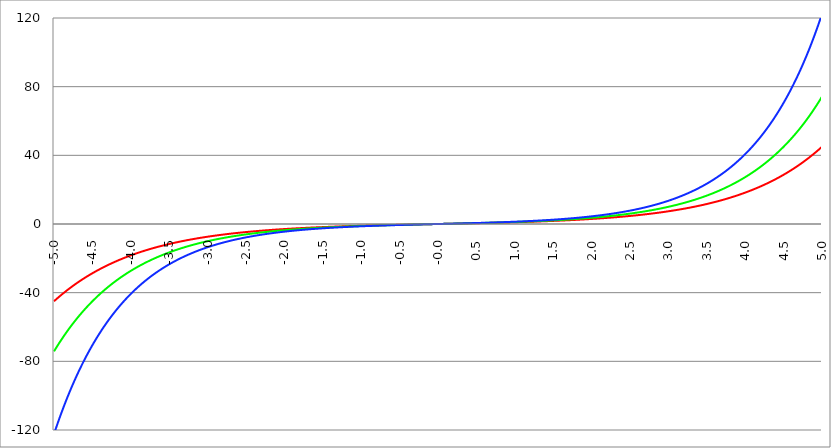
| Category | Series 1 | Series 0 | Series 2 |
|---|---|---|---|
| -5.0 | -45.003 | -74.203 | -122.344 |
| -4.995 | -44.801 | -73.833 | -121.673 |
| -4.99 | -44.6 | -73.465 | -121.005 |
| -4.985 | -44.399 | -73.098 | -120.342 |
| -4.98 | -44.2 | -72.734 | -119.682 |
| -4.975 | -44.001 | -72.371 | -119.025 |
| -4.97 | -43.804 | -72.01 | -118.372 |
| -4.965000000000001 | -43.607 | -71.651 | -117.723 |
| -4.960000000000001 | -43.411 | -71.293 | -117.077 |
| -4.955000000000001 | -43.216 | -70.938 | -116.435 |
| -4.950000000000001 | -43.022 | -70.584 | -115.796 |
| -4.945000000000001 | -42.829 | -70.232 | -115.161 |
| -4.940000000000001 | -42.637 | -69.882 | -114.53 |
| -4.935000000000001 | -42.445 | -69.533 | -113.901 |
| -4.930000000000001 | -42.255 | -69.186 | -113.277 |
| -4.925000000000002 | -42.065 | -68.841 | -112.655 |
| -4.920000000000002 | -41.876 | -68.498 | -112.037 |
| -4.915000000000002 | -41.688 | -68.156 | -111.423 |
| -4.910000000000002 | -41.501 | -67.816 | -110.812 |
| -4.905000000000002 | -41.314 | -67.478 | -110.204 |
| -4.900000000000002 | -41.129 | -67.141 | -109.599 |
| -4.895000000000002 | -40.944 | -66.806 | -108.998 |
| -4.890000000000002 | -40.76 | -66.473 | -108.4 |
| -4.885000000000002 | -40.577 | -66.141 | -107.806 |
| -4.880000000000002 | -40.395 | -65.812 | -107.214 |
| -4.875000000000003 | -40.213 | -65.483 | -106.626 |
| -4.870000000000003 | -40.033 | -65.157 | -106.042 |
| -4.865000000000003 | -39.853 | -64.832 | -105.46 |
| -4.860000000000003 | -39.674 | -64.508 | -104.881 |
| -4.855000000000003 | -39.496 | -64.186 | -104.306 |
| -4.850000000000003 | -39.318 | -63.866 | -103.734 |
| -4.845000000000003 | -39.142 | -63.548 | -103.165 |
| -4.840000000000003 | -38.966 | -63.231 | -102.599 |
| -4.835000000000003 | -38.791 | -62.915 | -102.036 |
| -4.830000000000004 | -38.617 | -62.601 | -101.477 |
| -4.825000000000004 | -38.443 | -62.289 | -100.92 |
| -4.820000000000004 | -38.271 | -61.979 | -100.366 |
| -4.815000000000004 | -38.099 | -61.669 | -99.816 |
| -4.810000000000004 | -37.928 | -61.362 | -99.268 |
| -4.805000000000004 | -37.757 | -61.056 | -98.724 |
| -4.800000000000004 | -37.588 | -60.751 | -98.182 |
| -4.795000000000004 | -37.419 | -60.448 | -97.644 |
| -4.790000000000004 | -37.251 | -60.147 | -97.108 |
| -4.785000000000004 | -37.083 | -59.847 | -96.576 |
| -4.780000000000004 | -36.917 | -59.548 | -96.046 |
| -4.775000000000004 | -36.751 | -59.251 | -95.519 |
| -4.770000000000004 | -36.586 | -58.955 | -94.995 |
| -4.765000000000005 | -36.422 | -58.661 | -94.474 |
| -4.760000000000005 | -36.258 | -58.369 | -93.956 |
| -4.755000000000005 | -36.095 | -58.078 | -93.44 |
| -4.750000000000005 | -35.933 | -57.788 | -92.928 |
| -4.745000000000005 | -35.772 | -57.5 | -92.418 |
| -4.740000000000005 | -35.611 | -57.213 | -91.911 |
| -4.735000000000005 | -35.451 | -56.927 | -91.407 |
| -4.730000000000005 | -35.292 | -56.643 | -90.906 |
| -4.725000000000006 | -35.133 | -56.361 | -90.407 |
| -4.720000000000006 | -34.976 | -56.08 | -89.911 |
| -4.715000000000006 | -34.818 | -55.8 | -89.418 |
| -4.710000000000006 | -34.662 | -55.522 | -88.927 |
| -4.705000000000006 | -34.506 | -55.245 | -88.44 |
| -4.700000000000006 | -34.351 | -54.969 | -87.955 |
| -4.695000000000006 | -34.197 | -54.695 | -87.472 |
| -4.690000000000006 | -34.043 | -54.422 | -86.992 |
| -4.685000000000007 | -33.891 | -54.151 | -86.515 |
| -4.680000000000007 | -33.738 | -53.88 | -86.041 |
| -4.675000000000007 | -33.587 | -53.612 | -85.569 |
| -4.670000000000007 | -33.436 | -53.344 | -85.099 |
| -4.665000000000007 | -33.286 | -53.078 | -84.632 |
| -4.660000000000007 | -33.136 | -52.813 | -84.168 |
| -4.655000000000007 | -32.987 | -52.55 | -83.707 |
| -4.650000000000007 | -32.839 | -52.288 | -83.247 |
| -4.645000000000007 | -32.692 | -52.027 | -82.791 |
| -4.640000000000008 | -32.545 | -51.767 | -82.337 |
| -4.635000000000008 | -32.399 | -51.509 | -81.885 |
| -4.630000000000008 | -32.253 | -51.252 | -81.436 |
| -4.625000000000008 | -32.108 | -50.996 | -80.989 |
| -4.620000000000008 | -31.964 | -50.742 | -80.545 |
| -4.615000000000008 | -31.82 | -50.489 | -80.103 |
| -4.610000000000008 | -31.677 | -50.237 | -79.664 |
| -4.605000000000008 | -31.535 | -49.986 | -79.227 |
| -4.600000000000008 | -31.393 | -49.737 | -78.792 |
| -4.595000000000009 | -31.252 | -49.489 | -78.36 |
| -4.590000000000009 | -31.112 | -49.242 | -77.93 |
| -4.585000000000009 | -30.972 | -48.996 | -77.503 |
| -4.580000000000009 | -30.833 | -48.752 | -77.077 |
| -4.57500000000001 | -30.695 | -48.509 | -76.655 |
| -4.57000000000001 | -30.557 | -48.267 | -76.234 |
| -4.565000000000009 | -30.419 | -48.026 | -75.816 |
| -4.560000000000009 | -30.283 | -47.787 | -75.4 |
| -4.555000000000009 | -30.147 | -47.548 | -74.987 |
| -4.55000000000001 | -30.011 | -47.311 | -74.575 |
| -4.54500000000001 | -29.877 | -47.075 | -74.166 |
| -4.54000000000001 | -29.742 | -46.84 | -73.759 |
| -4.53500000000001 | -29.609 | -46.606 | -73.355 |
| -4.53000000000001 | -29.476 | -46.374 | -72.952 |
| -4.52500000000001 | -29.343 | -46.143 | -72.552 |
| -4.52000000000001 | -29.211 | -45.912 | -72.154 |
| -4.51500000000001 | -29.08 | -45.683 | -71.758 |
| -4.51000000000001 | -28.95 | -45.455 | -71.365 |
| -4.505000000000011 | -28.819 | -45.229 | -70.973 |
| -4.500000000000011 | -28.69 | -45.003 | -70.584 |
| -4.495000000000011 | -28.561 | -44.779 | -70.197 |
| -4.490000000000011 | -28.433 | -44.555 | -69.812 |
| -4.485000000000011 | -28.305 | -44.333 | -69.429 |
| -4.480000000000011 | -28.178 | -44.112 | -69.048 |
| -4.475000000000011 | -28.051 | -43.892 | -68.669 |
| -4.470000000000011 | -27.925 | -43.673 | -68.292 |
| -4.465000000000011 | -27.8 | -43.455 | -67.918 |
| -4.460000000000011 | -27.675 | -43.238 | -67.545 |
| -4.455000000000012 | -27.551 | -43.022 | -67.175 |
| -4.450000000000012 | -27.427 | -42.808 | -66.806 |
| -4.445000000000012 | -27.304 | -42.594 | -66.44 |
| -4.440000000000012 | -27.181 | -42.382 | -66.075 |
| -4.435000000000012 | -27.059 | -42.17 | -65.713 |
| -4.430000000000012 | -26.937 | -41.96 | -65.352 |
| -4.425000000000012 | -26.816 | -41.75 | -64.994 |
| -4.420000000000012 | -26.696 | -41.542 | -64.637 |
| -4.415000000000012 | -26.576 | -41.335 | -64.283 |
| -4.410000000000013 | -26.456 | -41.129 | -63.93 |
| -4.405000000000013 | -26.337 | -40.923 | -63.579 |
| -4.400000000000013 | -26.219 | -40.719 | -63.231 |
| -4.395000000000013 | -26.101 | -40.516 | -62.884 |
| -4.390000000000013 | -25.984 | -40.314 | -62.539 |
| -4.385000000000013 | -25.867 | -40.113 | -62.196 |
| -4.380000000000013 | -25.751 | -39.913 | -61.855 |
| -4.375000000000013 | -25.635 | -39.714 | -61.515 |
| -4.370000000000013 | -25.52 | -39.515 | -61.178 |
| -4.365000000000013 | -25.406 | -39.318 | -60.842 |
| -4.360000000000014 | -25.291 | -39.122 | -60.509 |
| -4.355000000000014 | -25.178 | -38.927 | -60.177 |
| -4.350000000000014 | -25.065 | -38.733 | -59.847 |
| -4.345000000000014 | -24.952 | -38.54 | -59.518 |
| -4.340000000000014 | -24.84 | -38.347 | -59.192 |
| -4.335000000000014 | -24.728 | -38.156 | -58.867 |
| -4.330000000000014 | -24.617 | -37.966 | -58.544 |
| -4.325000000000014 | -24.506 | -37.776 | -58.223 |
| -4.320000000000014 | -24.396 | -37.588 | -57.904 |
| -4.315000000000015 | -24.287 | -37.4 | -57.586 |
| -4.310000000000015 | -24.178 | -37.214 | -57.27 |
| -4.305000000000015 | -24.069 | -37.028 | -56.956 |
| -4.300000000000015 | -23.961 | -36.843 | -56.643 |
| -4.295000000000015 | -23.853 | -36.659 | -56.333 |
| -4.290000000000015 | -23.746 | -36.476 | -56.024 |
| -4.285000000000015 | -23.639 | -36.294 | -55.716 |
| -4.280000000000015 | -23.533 | -36.113 | -55.411 |
| -4.275000000000015 | -23.427 | -35.933 | -55.107 |
| -4.270000000000015 | -23.322 | -35.754 | -54.804 |
| -4.265000000000016 | -23.217 | -35.575 | -54.504 |
| -4.260000000000016 | -23.113 | -35.398 | -54.205 |
| -4.255000000000016 | -23.009 | -35.221 | -53.907 |
| -4.250000000000016 | -22.905 | -35.046 | -53.612 |
| -4.245000000000016 | -22.803 | -34.871 | -53.318 |
| -4.240000000000016 | -22.7 | -34.697 | -53.025 |
| -4.235000000000016 | -22.598 | -34.524 | -52.734 |
| -4.230000000000016 | -22.496 | -34.351 | -52.445 |
| -4.225000000000017 | -22.395 | -34.18 | -52.157 |
| -4.220000000000017 | -22.295 | -34.009 | -51.871 |
| -4.215000000000017 | -22.195 | -33.84 | -51.586 |
| -4.210000000000017 | -22.095 | -33.671 | -51.303 |
| -4.205000000000017 | -21.995 | -33.503 | -51.022 |
| -4.200000000000017 | -21.897 | -33.336 | -50.742 |
| -4.195000000000017 | -21.798 | -33.169 | -50.464 |
| -4.190000000000017 | -21.7 | -33.004 | -50.187 |
| -4.185000000000017 | -21.603 | -32.839 | -49.912 |
| -4.180000000000017 | -21.506 | -32.675 | -49.638 |
| -4.175000000000018 | -21.409 | -32.512 | -49.365 |
| -4.170000000000018 | -21.313 | -32.35 | -49.095 |
| -4.165000000000018 | -21.217 | -32.189 | -48.825 |
| -4.160000000000018 | -21.122 | -32.028 | -48.557 |
| -4.155000000000018 | -21.027 | -31.868 | -48.291 |
| -4.150000000000018 | -20.932 | -31.709 | -48.026 |
| -4.145000000000018 | -20.838 | -31.551 | -47.763 |
| -4.140000000000018 | -20.744 | -31.393 | -47.501 |
| -4.135000000000018 | -20.651 | -31.237 | -47.24 |
| -4.130000000000019 | -20.558 | -31.081 | -46.981 |
| -4.125000000000019 | -20.466 | -30.926 | -46.723 |
| -4.120000000000019 | -20.374 | -30.771 | -46.467 |
| -4.115000000000019 | -20.282 | -30.618 | -46.212 |
| -4.110000000000019 | -20.191 | -30.465 | -45.958 |
| -4.105000000000019 | -20.1 | -30.313 | -45.706 |
| -4.100000000000019 | -20.01 | -30.162 | -45.455 |
| -4.095000000000019 | -19.92 | -30.011 | -45.206 |
| -4.090000000000019 | -19.83 | -29.862 | -44.958 |
| -4.085000000000019 | -19.741 | -29.713 | -44.711 |
| -4.08000000000002 | -19.653 | -29.564 | -44.466 |
| -4.07500000000002 | -19.564 | -29.417 | -44.222 |
| -4.07000000000002 | -19.476 | -29.27 | -43.979 |
| -4.06500000000002 | -19.389 | -29.124 | -43.738 |
| -4.06000000000002 | -19.301 | -28.979 | -43.498 |
| -4.05500000000002 | -19.215 | -28.834 | -43.26 |
| -4.05000000000002 | -19.128 | -28.69 | -43.022 |
| -4.04500000000002 | -19.042 | -28.547 | -42.786 |
| -4.04000000000002 | -18.957 | -28.404 | -42.551 |
| -4.03500000000002 | -18.871 | -28.263 | -42.318 |
| -4.03000000000002 | -18.787 | -28.122 | -42.086 |
| -4.025000000000021 | -18.702 | -27.981 | -41.855 |
| -4.020000000000021 | -18.618 | -27.842 | -41.625 |
| -4.015000000000021 | -18.534 | -27.703 | -41.397 |
| -4.010000000000021 | -18.451 | -27.564 | -41.17 |
| -4.005000000000021 | -18.368 | -27.427 | -40.944 |
| -4.000000000000021 | -18.285 | -27.29 | -40.719 |
| -3.995000000000021 | -18.203 | -27.154 | -40.496 |
| -3.990000000000021 | -18.121 | -27.018 | -40.274 |
| -3.985000000000022 | -18.04 | -26.883 | -40.053 |
| -3.980000000000022 | -17.959 | -26.749 | -39.833 |
| -3.975000000000022 | -17.878 | -26.616 | -39.614 |
| -3.970000000000022 | -17.798 | -26.483 | -39.397 |
| -3.965000000000022 | -17.718 | -26.351 | -39.181 |
| -3.960000000000022 | -17.638 | -26.219 | -38.966 |
| -3.955000000000022 | -17.559 | -26.088 | -38.752 |
| -3.950000000000022 | -17.48 | -25.958 | -38.54 |
| -3.945000000000022 | -17.401 | -25.828 | -38.328 |
| -3.940000000000023 | -17.323 | -25.7 | -38.118 |
| -3.935000000000023 | -17.245 | -25.571 | -37.909 |
| -3.930000000000023 | -17.167 | -25.444 | -37.701 |
| -3.925000000000023 | -17.09 | -25.317 | -37.494 |
| -3.920000000000023 | -17.013 | -25.19 | -37.288 |
| -3.915000000000023 | -16.937 | -25.065 | -37.083 |
| -3.910000000000023 | -16.861 | -24.939 | -36.88 |
| -3.905000000000023 | -16.785 | -24.815 | -36.678 |
| -3.900000000000023 | -16.709 | -24.691 | -36.476 |
| -3.895000000000023 | -16.634 | -24.568 | -36.276 |
| -3.890000000000024 | -16.559 | -24.445 | -36.077 |
| -3.885000000000024 | -16.485 | -24.323 | -35.879 |
| -3.880000000000024 | -16.411 | -24.202 | -35.682 |
| -3.875000000000024 | -16.337 | -24.081 | -35.487 |
| -3.870000000000024 | -16.263 | -23.961 | -35.292 |
| -3.865000000000024 | -16.19 | -23.841 | -35.098 |
| -3.860000000000024 | -16.117 | -23.722 | -34.906 |
| -3.855000000000024 | -16.045 | -23.604 | -34.714 |
| -3.850000000000024 | -15.973 | -23.486 | -34.524 |
| -3.845000000000025 | -15.901 | -23.369 | -34.334 |
| -3.840000000000025 | -15.829 | -23.252 | -34.146 |
| -3.835000000000025 | -15.758 | -23.136 | -33.958 |
| -3.830000000000025 | -15.687 | -23.02 | -33.772 |
| -3.825000000000025 | -15.617 | -22.905 | -33.587 |
| -3.820000000000025 | -15.546 | -22.791 | -33.402 |
| -3.815000000000025 | -15.476 | -22.677 | -33.219 |
| -3.810000000000025 | -15.407 | -22.564 | -33.037 |
| -3.805000000000025 | -15.337 | -22.451 | -32.856 |
| -3.800000000000026 | -15.268 | -22.339 | -32.675 |
| -3.795000000000026 | -15.2 | -22.228 | -32.496 |
| -3.790000000000026 | -15.131 | -22.117 | -32.318 |
| -3.785000000000026 | -15.063 | -22.006 | -32.14 |
| -3.780000000000026 | -14.995 | -21.897 | -31.964 |
| -3.775000000000026 | -14.928 | -21.787 | -31.789 |
| -3.770000000000026 | -14.861 | -21.679 | -31.614 |
| -3.765000000000026 | -14.794 | -21.57 | -31.441 |
| -3.760000000000026 | -14.727 | -21.463 | -31.268 |
| -3.755000000000026 | -14.661 | -21.355 | -31.096 |
| -3.750000000000027 | -14.595 | -21.249 | -30.926 |
| -3.745000000000027 | -14.529 | -21.143 | -30.756 |
| -3.740000000000027 | -14.464 | -21.037 | -30.587 |
| -3.735000000000027 | -14.399 | -20.932 | -30.419 |
| -3.730000000000027 | -14.334 | -20.828 | -30.253 |
| -3.725000000000027 | -14.27 | -20.724 | -30.087 |
| -3.720000000000027 | -14.205 | -20.62 | -29.921 |
| -3.715000000000027 | -14.141 | -20.517 | -29.757 |
| -3.710000000000027 | -14.078 | -20.415 | -29.594 |
| -3.705000000000028 | -14.014 | -20.313 | -29.431 |
| -3.700000000000028 | -13.951 | -20.211 | -29.27 |
| -3.695000000000028 | -13.888 | -20.11 | -29.109 |
| -3.690000000000028 | -13.826 | -20.01 | -28.95 |
| -3.685000000000028 | -13.764 | -19.91 | -28.791 |
| -3.680000000000028 | -13.702 | -19.811 | -28.633 |
| -3.675000000000028 | -13.64 | -19.712 | -28.476 |
| -3.670000000000028 | -13.579 | -19.613 | -28.319 |
| -3.665000000000028 | -13.518 | -19.515 | -28.164 |
| -3.660000000000028 | -13.457 | -19.418 | -28.009 |
| -3.655000000000029 | -13.396 | -19.321 | -27.856 |
| -3.650000000000029 | -13.336 | -19.224 | -27.703 |
| -3.645000000000029 | -13.276 | -19.128 | -27.551 |
| -3.640000000000029 | -13.216 | -19.033 | -27.399 |
| -3.635000000000029 | -13.156 | -18.938 | -27.249 |
| -3.630000000000029 | -13.097 | -18.843 | -27.099 |
| -3.625000000000029 | -13.038 | -18.749 | -26.951 |
| -3.620000000000029 | -12.98 | -18.655 | -26.803 |
| -3.615000000000029 | -12.921 | -18.562 | -26.656 |
| -3.61000000000003 | -12.863 | -18.47 | -26.509 |
| -3.60500000000003 | -12.805 | -18.377 | -26.364 |
| -3.60000000000003 | -12.747 | -18.285 | -26.219 |
| -3.59500000000003 | -12.69 | -18.194 | -26.075 |
| -3.59000000000003 | -12.633 | -18.103 | -25.932 |
| -3.58500000000003 | -12.576 | -18.013 | -25.79 |
| -3.58000000000003 | -12.519 | -17.923 | -25.648 |
| -3.57500000000003 | -12.463 | -17.833 | -25.507 |
| -3.57000000000003 | -12.407 | -17.744 | -25.367 |
| -3.565000000000031 | -12.351 | -17.656 | -25.228 |
| -3.560000000000031 | -12.295 | -17.567 | -25.09 |
| -3.555000000000031 | -12.24 | -17.48 | -24.952 |
| -3.550000000000031 | -12.185 | -17.392 | -24.815 |
| -3.545000000000031 | -12.13 | -17.305 | -24.679 |
| -3.540000000000031 | -12.075 | -17.219 | -24.543 |
| -3.535000000000031 | -12.021 | -17.133 | -24.409 |
| -3.530000000000031 | -11.967 | -17.047 | -24.275 |
| -3.525000000000031 | -11.913 | -16.962 | -24.141 |
| -3.520000000000032 | -11.859 | -16.877 | -24.009 |
| -3.515000000000032 | -11.805 | -16.793 | -23.877 |
| -3.510000000000032 | -11.752 | -16.709 | -23.746 |
| -3.505000000000032 | -11.699 | -16.626 | -23.616 |
| -3.500000000000032 | -11.647 | -16.543 | -23.486 |
| -3.495000000000032 | -11.594 | -16.46 | -23.357 |
| -3.490000000000032 | -11.542 | -16.378 | -23.229 |
| -3.485000000000032 | -11.49 | -16.296 | -23.101 |
| -3.480000000000032 | -11.438 | -16.214 | -22.974 |
| -3.475000000000032 | -11.387 | -16.133 | -22.848 |
| -3.470000000000033 | -11.335 | -16.053 | -22.723 |
| -3.465000000000033 | -11.284 | -15.973 | -22.598 |
| -3.460000000000033 | -11.233 | -15.893 | -22.474 |
| -3.455000000000033 | -11.183 | -15.813 | -22.351 |
| -3.450000000000033 | -11.132 | -15.734 | -22.228 |
| -3.445000000000033 | -11.082 | -15.656 | -22.106 |
| -3.440000000000033 | -11.032 | -15.577 | -21.984 |
| -3.435000000000033 | -10.982 | -15.5 | -21.864 |
| -3.430000000000033 | -10.933 | -15.422 | -21.744 |
| -3.425000000000034 | -10.884 | -15.345 | -21.624 |
| -3.420000000000034 | -10.834 | -15.268 | -21.506 |
| -3.415000000000034 | -10.786 | -15.192 | -21.388 |
| -3.410000000000034 | -10.737 | -15.116 | -21.27 |
| -3.405000000000034 | -10.689 | -15.041 | -21.153 |
| -3.400000000000034 | -10.64 | -14.965 | -21.037 |
| -3.395000000000034 | -10.592 | -14.891 | -20.922 |
| -3.390000000000034 | -10.545 | -14.816 | -20.807 |
| -3.385000000000034 | -10.497 | -14.742 | -20.692 |
| -3.380000000000034 | -10.45 | -14.668 | -20.579 |
| -3.375000000000035 | -10.403 | -14.595 | -20.466 |
| -3.370000000000035 | -10.356 | -14.522 | -20.353 |
| -3.365000000000035 | -10.309 | -14.449 | -20.242 |
| -3.360000000000035 | -10.262 | -14.377 | -20.131 |
| -3.355000000000035 | -10.216 | -14.305 | -20.02 |
| -3.350000000000035 | -10.17 | -14.234 | -19.91 |
| -3.345000000000035 | -10.124 | -14.163 | -19.801 |
| -3.340000000000035 | -10.078 | -14.092 | -19.692 |
| -3.335000000000035 | -10.033 | -14.021 | -19.584 |
| -3.330000000000036 | -9.988 | -13.951 | -19.476 |
| -3.325000000000036 | -9.943 | -13.882 | -19.369 |
| -3.320000000000036 | -9.898 | -13.812 | -19.263 |
| -3.315000000000036 | -9.853 | -13.743 | -19.157 |
| -3.310000000000036 | -9.809 | -13.674 | -19.052 |
| -3.305000000000036 | -9.764 | -13.606 | -18.947 |
| -3.300000000000036 | -9.72 | -13.538 | -18.843 |
| -3.295000000000036 | -9.676 | -13.47 | -18.74 |
| -3.290000000000036 | -9.633 | -13.403 | -18.637 |
| -3.285000000000036 | -9.589 | -13.336 | -18.534 |
| -3.280000000000036 | -9.546 | -13.269 | -18.433 |
| -3.275000000000037 | -9.503 | -13.203 | -18.331 |
| -3.270000000000037 | -9.46 | -13.137 | -18.231 |
| -3.265000000000037 | -9.417 | -13.071 | -18.13 |
| -3.260000000000037 | -9.375 | -13.006 | -18.031 |
| -3.255000000000037 | -9.332 | -12.941 | -17.932 |
| -3.250000000000037 | -9.29 | -12.876 | -17.833 |
| -3.245000000000037 | -9.248 | -12.811 | -17.735 |
| -3.240000000000037 | -9.207 | -12.747 | -17.638 |
| -3.235000000000038 | -9.165 | -12.684 | -17.541 |
| -3.230000000000038 | -9.124 | -12.62 | -17.445 |
| -3.225000000000038 | -9.082 | -12.557 | -17.349 |
| -3.220000000000038 | -9.041 | -12.494 | -17.253 |
| -3.215000000000038 | -9.001 | -12.432 | -17.159 |
| -3.210000000000038 | -8.96 | -12.369 | -17.064 |
| -3.205000000000038 | -8.919 | -12.307 | -16.971 |
| -3.200000000000038 | -8.879 | -12.246 | -16.877 |
| -3.195000000000038 | -8.839 | -12.185 | -16.785 |
| -3.190000000000039 | -8.799 | -12.124 | -16.692 |
| -3.185000000000039 | -8.759 | -12.063 | -16.601 |
| -3.180000000000039 | -8.72 | -12.003 | -16.51 |
| -3.175000000000039 | -8.68 | -11.943 | -16.419 |
| -3.170000000000039 | -8.641 | -11.883 | -16.329 |
| -3.16500000000004 | -8.602 | -11.823 | -16.239 |
| -3.16000000000004 | -8.563 | -11.764 | -16.15 |
| -3.155000000000039 | -8.524 | -11.705 | -16.061 |
| -3.150000000000039 | -8.486 | -11.647 | -15.973 |
| -3.14500000000004 | -8.447 | -11.588 | -15.885 |
| -3.14000000000004 | -8.409 | -11.53 | -15.798 |
| -3.13500000000004 | -8.371 | -11.473 | -15.711 |
| -3.13000000000004 | -8.333 | -11.415 | -15.624 |
| -3.12500000000004 | -8.296 | -11.358 | -15.538 |
| -3.12000000000004 | -8.258 | -11.301 | -15.453 |
| -3.11500000000004 | -8.221 | -11.245 | -15.368 |
| -3.11000000000004 | -8.184 | -11.188 | -15.284 |
| -3.10500000000004 | -8.147 | -11.132 | -15.2 |
| -3.10000000000004 | -8.11 | -11.076 | -15.116 |
| -3.095000000000041 | -8.073 | -11.021 | -15.033 |
| -3.090000000000041 | -8.037 | -10.966 | -14.95 |
| -3.085000000000041 | -8 | -10.911 | -14.868 |
| -3.080000000000041 | -7.964 | -10.856 | -14.786 |
| -3.075000000000041 | -7.928 | -10.802 | -14.705 |
| -3.070000000000041 | -7.892 | -10.748 | -14.624 |
| -3.065000000000041 | -7.856 | -10.694 | -14.544 |
| -3.060000000000041 | -7.821 | -10.64 | -14.464 |
| -3.055000000000041 | -7.785 | -10.587 | -14.384 |
| -3.050000000000042 | -7.75 | -10.534 | -14.305 |
| -3.045000000000042 | -7.715 | -10.481 | -14.227 |
| -3.040000000000042 | -7.68 | -10.429 | -14.148 |
| -3.035000000000042 | -7.645 | -10.376 | -14.071 |
| -3.030000000000042 | -7.611 | -10.324 | -13.993 |
| -3.025000000000042 | -7.576 | -10.273 | -13.916 |
| -3.020000000000042 | -7.542 | -10.221 | -13.84 |
| -3.015000000000042 | -7.508 | -10.17 | -13.764 |
| -3.010000000000042 | -7.474 | -10.119 | -13.688 |
| -3.005000000000043 | -7.44 | -10.068 | -13.613 |
| -3.000000000000043 | -7.406 | -10.018 | -13.538 |
| -2.995000000000043 | -7.373 | -9.968 | -13.463 |
| -2.990000000000043 | -7.339 | -9.918 | -13.389 |
| -2.985000000000043 | -7.306 | -9.868 | -13.316 |
| -2.980000000000043 | -7.273 | -9.819 | -13.242 |
| -2.975000000000043 | -7.24 | -9.769 | -13.17 |
| -2.970000000000043 | -7.207 | -9.72 | -13.097 |
| -2.965000000000043 | -7.174 | -9.672 | -13.025 |
| -2.960000000000043 | -7.142 | -9.623 | -12.954 |
| -2.955000000000044 | -7.11 | -9.575 | -12.882 |
| -2.950000000000044 | -7.077 | -9.527 | -12.811 |
| -2.945000000000044 | -7.045 | -9.479 | -12.741 |
| -2.940000000000044 | -7.013 | -9.431 | -12.671 |
| -2.935000000000044 | -6.981 | -9.384 | -12.601 |
| -2.930000000000044 | -6.95 | -9.337 | -12.532 |
| -2.925000000000044 | -6.918 | -9.29 | -12.463 |
| -2.920000000000044 | -6.887 | -9.244 | -12.394 |
| -2.915000000000044 | -6.856 | -9.197 | -12.326 |
| -2.910000000000045 | -6.825 | -9.151 | -12.258 |
| -2.905000000000045 | -6.794 | -9.105 | -12.191 |
| -2.900000000000045 | -6.763 | -9.06 | -12.124 |
| -2.895000000000045 | -6.732 | -9.014 | -12.057 |
| -2.890000000000045 | -6.702 | -8.969 | -11.991 |
| -2.885000000000045 | -6.671 | -8.924 | -11.925 |
| -2.880000000000045 | -6.641 | -8.879 | -11.859 |
| -2.875000000000045 | -6.611 | -8.835 | -11.794 |
| -2.870000000000045 | -6.581 | -8.79 | -11.729 |
| -2.865000000000045 | -6.551 | -8.746 | -11.664 |
| -2.860000000000046 | -6.521 | -8.702 | -11.6 |
| -2.855000000000046 | -6.491 | -8.658 | -11.536 |
| -2.850000000000046 | -6.462 | -8.615 | -11.473 |
| -2.845000000000046 | -6.433 | -8.572 | -11.409 |
| -2.840000000000046 | -6.403 | -8.529 | -11.347 |
| -2.835000000000046 | -6.374 | -8.486 | -11.284 |
| -2.830000000000046 | -6.345 | -8.443 | -11.222 |
| -2.825000000000046 | -6.316 | -8.401 | -11.16 |
| -2.820000000000046 | -6.288 | -8.359 | -11.099 |
| -2.815000000000047 | -6.259 | -8.317 | -11.038 |
| -2.810000000000047 | -6.231 | -8.275 | -10.977 |
| -2.805000000000047 | -6.202 | -8.233 | -10.916 |
| -2.800000000000047 | -6.174 | -8.192 | -10.856 |
| -2.795000000000047 | -6.146 | -8.151 | -10.796 |
| -2.790000000000047 | -6.118 | -8.11 | -10.737 |
| -2.785000000000047 | -6.09 | -8.069 | -10.678 |
| -2.780000000000047 | -6.062 | -8.028 | -10.619 |
| -2.775000000000047 | -6.035 | -7.988 | -10.56 |
| -2.770000000000047 | -6.007 | -7.948 | -10.502 |
| -2.765000000000048 | -5.98 | -7.908 | -10.444 |
| -2.760000000000048 | -5.953 | -7.868 | -10.387 |
| -2.755000000000048 | -5.926 | -7.829 | -10.33 |
| -2.750000000000048 | -5.899 | -7.789 | -10.273 |
| -2.745000000000048 | -5.872 | -7.75 | -10.216 |
| -2.740000000000048 | -5.845 | -7.711 | -10.16 |
| -2.735000000000048 | -5.819 | -7.672 | -10.104 |
| -2.730000000000048 | -5.792 | -7.634 | -10.048 |
| -2.725000000000048 | -5.766 | -7.595 | -9.993 |
| -2.720000000000049 | -5.739 | -7.557 | -9.938 |
| -2.715000000000049 | -5.713 | -7.519 | -9.883 |
| -2.710000000000049 | -5.687 | -7.481 | -9.828 |
| -2.705000000000049 | -5.661 | -7.444 | -9.774 |
| -2.700000000000049 | -5.635 | -7.406 | -9.72 |
| -2.695000000000049 | -5.61 | -7.369 | -9.667 |
| -2.690000000000049 | -5.584 | -7.332 | -9.613 |
| -2.685000000000049 | -5.559 | -7.295 | -9.56 |
| -2.680000000000049 | -5.533 | -7.258 | -9.508 |
| -2.675000000000049 | -5.508 | -7.222 | -9.455 |
| -2.67000000000005 | -5.483 | -7.185 | -9.403 |
| -2.66500000000005 | -5.458 | -7.149 | -9.351 |
| -2.66000000000005 | -5.433 | -7.113 | -9.3 |
| -2.65500000000005 | -5.408 | -7.077 | -9.248 |
| -2.65000000000005 | -5.383 | -7.042 | -9.197 |
| -2.64500000000005 | -5.359 | -7.006 | -9.147 |
| -2.64000000000005 | -5.334 | -6.971 | -9.096 |
| -2.63500000000005 | -5.31 | -6.936 | -9.046 |
| -2.63000000000005 | -5.286 | -6.901 | -8.996 |
| -2.625000000000051 | -5.262 | -6.866 | -8.946 |
| -2.620000000000051 | -5.238 | -6.831 | -8.897 |
| -2.615000000000051 | -5.214 | -6.797 | -8.848 |
| -2.610000000000051 | -5.19 | -6.763 | -8.799 |
| -2.605000000000051 | -5.166 | -6.729 | -8.75 |
| -2.600000000000051 | -5.142 | -6.695 | -8.702 |
| -2.595000000000051 | -5.119 | -6.661 | -8.654 |
| -2.590000000000051 | -5.096 | -6.627 | -8.606 |
| -2.585000000000051 | -5.072 | -6.594 | -8.559 |
| -2.580000000000052 | -5.049 | -6.561 | -8.512 |
| -2.575000000000052 | -5.026 | -6.528 | -8.465 |
| -2.570000000000052 | -5.003 | -6.495 | -8.418 |
| -2.565000000000052 | -4.98 | -6.462 | -8.371 |
| -2.560000000000052 | -4.957 | -6.429 | -8.325 |
| -2.555000000000052 | -4.934 | -6.397 | -8.279 |
| -2.550000000000052 | -4.912 | -6.365 | -8.233 |
| -2.545000000000052 | -4.889 | -6.332 | -8.188 |
| -2.540000000000052 | -4.867 | -6.3 | -8.143 |
| -2.535000000000053 | -4.845 | -6.269 | -8.098 |
| -2.530000000000053 | -4.822 | -6.237 | -8.053 |
| -2.525000000000053 | -4.8 | -6.205 | -8.008 |
| -2.520000000000053 | -4.778 | -6.174 | -7.964 |
| -2.515000000000053 | -4.756 | -6.143 | -7.92 |
| -2.510000000000053 | -4.735 | -6.112 | -7.876 |
| -2.505000000000053 | -4.713 | -6.081 | -7.833 |
| -2.500000000000053 | -4.691 | -6.05 | -7.789 |
| -2.495000000000053 | -4.67 | -6.02 | -7.746 |
| -2.490000000000053 | -4.648 | -5.989 | -7.703 |
| -2.485000000000054 | -4.627 | -5.959 | -7.661 |
| -2.480000000000054 | -4.606 | -5.929 | -7.618 |
| -2.475000000000054 | -4.584 | -5.899 | -7.576 |
| -2.470000000000054 | -4.563 | -5.869 | -7.534 |
| -2.465000000000054 | -4.542 | -5.839 | -7.493 |
| -2.460000000000054 | -4.521 | -5.81 | -7.451 |
| -2.455000000000054 | -4.501 | -5.78 | -7.41 |
| -2.450000000000054 | -4.48 | -5.751 | -7.369 |
| -2.445000000000054 | -4.459 | -5.722 | -7.328 |
| -2.440000000000055 | -4.439 | -5.693 | -7.288 |
| -2.435000000000055 | -4.418 | -5.664 | -7.247 |
| -2.430000000000055 | -4.398 | -5.635 | -7.207 |
| -2.425000000000055 | -4.378 | -5.607 | -7.167 |
| -2.420000000000055 | -4.358 | -5.578 | -7.128 |
| -2.415000000000055 | -4.338 | -5.55 | -7.088 |
| -2.410000000000055 | -4.318 | -5.522 | -7.049 |
| -2.405000000000055 | -4.298 | -5.494 | -7.01 |
| -2.400000000000055 | -4.278 | -5.466 | -6.971 |
| -2.395000000000055 | -4.258 | -5.439 | -6.932 |
| -2.390000000000056 | -4.239 | -5.411 | -6.894 |
| -2.385000000000056 | -4.219 | -5.383 | -6.856 |
| -2.380000000000056 | -4.2 | -5.356 | -6.818 |
| -2.375000000000056 | -4.18 | -5.329 | -6.78 |
| -2.370000000000056 | -4.161 | -5.302 | -6.742 |
| -2.365000000000056 | -4.142 | -5.275 | -6.705 |
| -2.360000000000056 | -4.122 | -5.248 | -6.668 |
| -2.355000000000056 | -4.103 | -5.222 | -6.631 |
| -2.350000000000056 | -4.084 | -5.195 | -6.594 |
| -2.345000000000057 | -4.066 | -5.169 | -6.557 |
| -2.340000000000057 | -4.047 | -5.142 | -6.521 |
| -2.335000000000057 | -4.028 | -5.116 | -6.485 |
| -2.330000000000057 | -4.009 | -5.09 | -6.449 |
| -2.325000000000057 | -3.991 | -5.064 | -6.413 |
| -2.320000000000057 | -3.972 | -5.039 | -6.377 |
| -2.315000000000057 | -3.954 | -5.013 | -6.342 |
| -2.310000000000057 | -3.936 | -4.988 | -6.307 |
| -2.305000000000057 | -3.917 | -4.962 | -6.272 |
| -2.300000000000058 | -3.899 | -4.937 | -6.237 |
| -2.295000000000058 | -3.881 | -4.912 | -6.202 |
| -2.290000000000058 | -3.863 | -4.887 | -6.168 |
| -2.285000000000058 | -3.845 | -4.862 | -6.134 |
| -2.280000000000058 | -3.827 | -4.837 | -6.099 |
| -2.275000000000058 | -3.81 | -4.813 | -6.066 |
| -2.270000000000058 | -3.792 | -4.788 | -6.032 |
| -2.265000000000058 | -3.774 | -4.764 | -5.998 |
| -2.260000000000058 | -3.757 | -4.739 | -5.965 |
| -2.255000000000058 | -3.739 | -4.715 | -5.932 |
| -2.250000000000059 | -3.722 | -4.691 | -5.899 |
| -2.245000000000059 | -3.705 | -4.667 | -5.866 |
| -2.240000000000059 | -3.688 | -4.643 | -5.833 |
| -2.235000000000059 | -3.67 | -4.62 | -5.801 |
| -2.23000000000006 | -3.653 | -4.596 | -5.769 |
| -2.22500000000006 | -3.636 | -4.573 | -5.736 |
| -2.22000000000006 | -3.619 | -4.549 | -5.705 |
| -2.215000000000059 | -3.602 | -4.526 | -5.673 |
| -2.210000000000059 | -3.586 | -4.503 | -5.641 |
| -2.20500000000006 | -3.569 | -4.48 | -5.61 |
| -2.20000000000006 | -3.552 | -4.457 | -5.578 |
| -2.19500000000006 | -3.536 | -4.434 | -5.547 |
| -2.19000000000006 | -3.519 | -4.412 | -5.516 |
| -2.18500000000006 | -3.503 | -4.389 | -5.486 |
| -2.18000000000006 | -3.486 | -4.367 | -5.455 |
| -2.17500000000006 | -3.47 | -4.344 | -5.425 |
| -2.17000000000006 | -3.454 | -4.322 | -5.394 |
| -2.16500000000006 | -3.438 | -4.3 | -5.364 |
| -2.160000000000061 | -3.422 | -4.278 | -5.334 |
| -2.155000000000061 | -3.406 | -4.256 | -5.305 |
| -2.150000000000061 | -3.39 | -4.234 | -5.275 |
| -2.145000000000061 | -3.374 | -4.212 | -5.246 |
| -2.140000000000061 | -3.358 | -4.191 | -5.216 |
| -2.135000000000061 | -3.342 | -4.169 | -5.187 |
| -2.130000000000061 | -3.327 | -4.148 | -5.158 |
| -2.125000000000061 | -3.311 | -4.127 | -5.129 |
| -2.120000000000061 | -3.296 | -4.106 | -5.101 |
| -2.115000000000061 | -3.28 | -4.084 | -5.072 |
| -2.110000000000062 | -3.265 | -4.064 | -5.044 |
| -2.105000000000062 | -3.249 | -4.043 | -5.016 |
| -2.100000000000062 | -3.234 | -4.022 | -4.988 |
| -2.095000000000062 | -3.219 | -4.001 | -4.96 |
| -2.090000000000062 | -3.204 | -3.981 | -4.932 |
| -2.085000000000062 | -3.189 | -3.96 | -4.904 |
| -2.080000000000062 | -3.174 | -3.94 | -4.877 |
| -2.075000000000062 | -3.159 | -3.919 | -4.85 |
| -2.070000000000062 | -3.144 | -3.899 | -4.822 |
| -2.065000000000063 | -3.129 | -3.879 | -4.795 |
| -2.060000000000063 | -3.114 | -3.859 | -4.769 |
| -2.055000000000063 | -3.1 | -3.839 | -4.742 |
| -2.050000000000063 | -3.085 | -3.82 | -4.715 |
| -2.045000000000063 | -3.07 | -3.8 | -4.689 |
| -2.040000000000063 | -3.056 | -3.78 | -4.662 |
| -2.035000000000063 | -3.042 | -3.761 | -4.636 |
| -2.030000000000063 | -3.027 | -3.741 | -4.61 |
| -2.025000000000063 | -3.013 | -3.722 | -4.584 |
| -2.020000000000064 | -2.999 | -3.703 | -4.559 |
| -2.015000000000064 | -2.984 | -3.684 | -4.533 |
| -2.010000000000064 | -2.97 | -3.665 | -4.508 |
| -2.005000000000064 | -2.956 | -3.646 | -4.482 |
| -2.000000000000064 | -2.942 | -3.627 | -4.457 |
| -1.995000000000064 | -2.928 | -3.608 | -4.432 |
| -1.990000000000064 | -2.914 | -3.589 | -4.407 |
| -1.985000000000064 | -2.9 | -3.571 | -4.382 |
| -1.980000000000064 | -2.887 | -3.552 | -4.358 |
| -1.975000000000064 | -2.873 | -3.534 | -4.333 |
| -1.970000000000065 | -2.859 | -3.516 | -4.309 |
| -1.965000000000065 | -2.846 | -3.497 | -4.285 |
| -1.960000000000065 | -2.832 | -3.479 | -4.26 |
| -1.955000000000065 | -2.819 | -3.461 | -4.236 |
| -1.950000000000065 | -2.805 | -3.443 | -4.212 |
| -1.945000000000065 | -2.792 | -3.425 | -4.189 |
| -1.940000000000065 | -2.779 | -3.408 | -4.165 |
| -1.935000000000065 | -2.765 | -3.39 | -4.142 |
| -1.930000000000065 | -2.752 | -3.372 | -4.118 |
| -1.925000000000066 | -2.739 | -3.355 | -4.095 |
| -1.920000000000066 | -2.726 | -3.337 | -4.072 |
| -1.915000000000066 | -2.713 | -3.32 | -4.049 |
| -1.910000000000066 | -2.7 | -3.303 | -4.026 |
| -1.905000000000066 | -2.687 | -3.285 | -4.003 |
| -1.900000000000066 | -2.674 | -3.268 | -3.981 |
| -1.895000000000066 | -2.661 | -3.251 | -3.958 |
| -1.890000000000066 | -2.648 | -3.234 | -3.936 |
| -1.885000000000066 | -2.636 | -3.217 | -3.913 |
| -1.880000000000066 | -2.623 | -3.2 | -3.891 |
| -1.875000000000067 | -2.61 | -3.184 | -3.869 |
| -1.870000000000067 | -2.598 | -3.167 | -3.847 |
| -1.865000000000067 | -2.585 | -3.151 | -3.826 |
| -1.860000000000067 | -2.573 | -3.134 | -3.804 |
| -1.855000000000067 | -2.561 | -3.118 | -3.782 |
| -1.850000000000067 | -2.548 | -3.101 | -3.761 |
| -1.845000000000067 | -2.536 | -3.085 | -3.739 |
| -1.840000000000067 | -2.524 | -3.069 | -3.718 |
| -1.835000000000067 | -2.512 | -3.053 | -3.697 |
| -1.830000000000068 | -2.499 | -3.037 | -3.676 |
| -1.825000000000068 | -2.487 | -3.021 | -3.655 |
| -1.820000000000068 | -2.475 | -3.005 | -3.634 |
| -1.815000000000068 | -2.463 | -2.989 | -3.614 |
| -1.810000000000068 | -2.451 | -2.973 | -3.593 |
| -1.805000000000068 | -2.439 | -2.958 | -3.573 |
| -1.800000000000068 | -2.428 | -2.942 | -3.552 |
| -1.795000000000068 | -2.416 | -2.927 | -3.532 |
| -1.790000000000068 | -2.404 | -2.911 | -3.512 |
| -1.785000000000068 | -2.392 | -2.896 | -3.492 |
| -1.780000000000069 | -2.381 | -2.881 | -3.472 |
| -1.775000000000069 | -2.369 | -2.865 | -3.452 |
| -1.770000000000069 | -2.358 | -2.85 | -3.432 |
| -1.765000000000069 | -2.346 | -2.835 | -3.413 |
| -1.760000000000069 | -2.335 | -2.82 | -3.393 |
| -1.75500000000007 | -2.323 | -2.805 | -3.374 |
| -1.75000000000007 | -2.312 | -2.79 | -3.355 |
| -1.745000000000069 | -2.301 | -2.776 | -3.335 |
| -1.740000000000069 | -2.289 | -2.761 | -3.316 |
| -1.73500000000007 | -2.278 | -2.746 | -3.297 |
| -1.73000000000007 | -2.267 | -2.732 | -3.278 |
| -1.72500000000007 | -2.256 | -2.717 | -3.26 |
| -1.72000000000007 | -2.245 | -2.703 | -3.241 |
| -1.71500000000007 | -2.234 | -2.688 | -3.222 |
| -1.71000000000007 | -2.223 | -2.674 | -3.204 |
| -1.70500000000007 | -2.212 | -2.66 | -3.185 |
| -1.70000000000007 | -2.201 | -2.646 | -3.167 |
| -1.69500000000007 | -2.19 | -2.632 | -3.149 |
| -1.69000000000007 | -2.179 | -2.617 | -3.131 |
| -1.685000000000071 | -2.168 | -2.604 | -3.113 |
| -1.680000000000071 | -2.158 | -2.59 | -3.095 |
| -1.675000000000071 | -2.147 | -2.576 | -3.077 |
| -1.670000000000071 | -2.136 | -2.562 | -3.059 |
| -1.665000000000071 | -2.126 | -2.548 | -3.042 |
| -1.660000000000071 | -2.115 | -2.535 | -3.024 |
| -1.655000000000071 | -2.105 | -2.521 | -3.007 |
| -1.650000000000071 | -2.094 | -2.507 | -2.989 |
| -1.645000000000071 | -2.084 | -2.494 | -2.972 |
| -1.640000000000072 | -2.073 | -2.481 | -2.955 |
| -1.635000000000072 | -2.063 | -2.467 | -2.938 |
| -1.630000000000072 | -2.053 | -2.454 | -2.92 |
| -1.625000000000072 | -2.043 | -2.441 | -2.904 |
| -1.620000000000072 | -2.032 | -2.428 | -2.887 |
| -1.615000000000072 | -2.022 | -2.414 | -2.87 |
| -1.610000000000072 | -2.012 | -2.401 | -2.853 |
| -1.605000000000072 | -2.002 | -2.388 | -2.837 |
| -1.600000000000072 | -1.992 | -2.376 | -2.82 |
| -1.595000000000073 | -1.982 | -2.363 | -2.804 |
| -1.590000000000073 | -1.972 | -2.35 | -2.787 |
| -1.585000000000073 | -1.962 | -2.337 | -2.771 |
| -1.580000000000073 | -1.952 | -2.324 | -2.755 |
| -1.575000000000073 | -1.942 | -2.312 | -2.739 |
| -1.570000000000073 | -1.932 | -2.299 | -2.723 |
| -1.565000000000073 | -1.923 | -2.287 | -2.707 |
| -1.560000000000073 | -1.913 | -2.274 | -2.691 |
| -1.555000000000073 | -1.903 | -2.262 | -2.675 |
| -1.550000000000074 | -1.894 | -2.25 | -2.66 |
| -1.545000000000074 | -1.884 | -2.237 | -2.644 |
| -1.540000000000074 | -1.874 | -2.225 | -2.629 |
| -1.535000000000074 | -1.865 | -2.213 | -2.613 |
| -1.530000000000074 | -1.855 | -2.201 | -2.598 |
| -1.525000000000074 | -1.846 | -2.189 | -2.583 |
| -1.520000000000074 | -1.836 | -2.177 | -2.567 |
| -1.515000000000074 | -1.827 | -2.165 | -2.552 |
| -1.510000000000074 | -1.818 | -2.153 | -2.537 |
| -1.505000000000074 | -1.808 | -2.141 | -2.522 |
| -1.500000000000075 | -1.799 | -2.129 | -2.507 |
| -1.495000000000075 | -1.79 | -2.118 | -2.493 |
| -1.490000000000075 | -1.781 | -2.106 | -2.478 |
| -1.485000000000075 | -1.771 | -2.094 | -2.463 |
| -1.480000000000075 | -1.762 | -2.083 | -2.449 |
| -1.475000000000075 | -1.753 | -2.071 | -2.434 |
| -1.470000000000075 | -1.744 | -2.06 | -2.42 |
| -1.465000000000075 | -1.735 | -2.048 | -2.405 |
| -1.460000000000075 | -1.726 | -2.037 | -2.391 |
| -1.455000000000076 | -1.717 | -2.026 | -2.377 |
| -1.450000000000076 | -1.708 | -2.014 | -2.363 |
| -1.445000000000076 | -1.699 | -2.003 | -2.349 |
| -1.440000000000076 | -1.691 | -1.992 | -2.335 |
| -1.435000000000076 | -1.682 | -1.981 | -2.321 |
| -1.430000000000076 | -1.673 | -1.97 | -2.307 |
| -1.425000000000076 | -1.664 | -1.959 | -2.293 |
| -1.420000000000076 | -1.655 | -1.948 | -2.279 |
| -1.415000000000076 | -1.647 | -1.937 | -2.266 |
| -1.410000000000077 | -1.638 | -1.926 | -2.252 |
| -1.405000000000077 | -1.629 | -1.915 | -2.239 |
| -1.400000000000077 | -1.621 | -1.904 | -2.225 |
| -1.395000000000077 | -1.612 | -1.894 | -2.212 |
| -1.390000000000077 | -1.604 | -1.883 | -2.198 |
| -1.385000000000077 | -1.595 | -1.872 | -2.185 |
| -1.380000000000077 | -1.587 | -1.862 | -2.172 |
| -1.375000000000077 | -1.578 | -1.851 | -2.159 |
| -1.370000000000077 | -1.57 | -1.841 | -2.146 |
| -1.365000000000077 | -1.562 | -1.83 | -2.133 |
| -1.360000000000078 | -1.553 | -1.82 | -2.12 |
| -1.355000000000078 | -1.545 | -1.809 | -2.107 |
| -1.350000000000078 | -1.537 | -1.799 | -2.094 |
| -1.345000000000078 | -1.529 | -1.789 | -2.081 |
| -1.340000000000078 | -1.52 | -1.779 | -2.069 |
| -1.335000000000078 | -1.512 | -1.768 | -2.056 |
| -1.330000000000078 | -1.504 | -1.758 | -2.044 |
| -1.325000000000078 | -1.496 | -1.748 | -2.031 |
| -1.320000000000078 | -1.488 | -1.738 | -2.019 |
| -1.315000000000079 | -1.48 | -1.728 | -2.006 |
| -1.310000000000079 | -1.472 | -1.718 | -1.994 |
| -1.305000000000079 | -1.464 | -1.708 | -1.982 |
| -1.300000000000079 | -1.456 | -1.698 | -1.97 |
| -1.295000000000079 | -1.448 | -1.689 | -1.958 |
| -1.29000000000008 | -1.44 | -1.679 | -1.946 |
| -1.285000000000079 | -1.432 | -1.669 | -1.934 |
| -1.280000000000079 | -1.424 | -1.659 | -1.922 |
| -1.275000000000079 | -1.416 | -1.65 | -1.91 |
| -1.270000000000079 | -1.409 | -1.64 | -1.898 |
| -1.26500000000008 | -1.401 | -1.63 | -1.886 |
| -1.26000000000008 | -1.393 | -1.621 | -1.874 |
| -1.25500000000008 | -1.385 | -1.611 | -1.863 |
| -1.25000000000008 | -1.378 | -1.602 | -1.851 |
| -1.24500000000008 | -1.37 | -1.592 | -1.84 |
| -1.24000000000008 | -1.363 | -1.583 | -1.828 |
| -1.23500000000008 | -1.355 | -1.574 | -1.817 |
| -1.23000000000008 | -1.347 | -1.564 | -1.805 |
| -1.22500000000008 | -1.34 | -1.555 | -1.794 |
| -1.220000000000081 | -1.332 | -1.546 | -1.783 |
| -1.215000000000081 | -1.325 | -1.537 | -1.771 |
| -1.210000000000081 | -1.317 | -1.528 | -1.76 |
| -1.205000000000081 | -1.31 | -1.519 | -1.749 |
| -1.200000000000081 | -1.303 | -1.509 | -1.738 |
| -1.195000000000081 | -1.295 | -1.5 | -1.727 |
| -1.190000000000081 | -1.288 | -1.491 | -1.716 |
| -1.185000000000081 | -1.28 | -1.482 | -1.705 |
| -1.180000000000081 | -1.273 | -1.474 | -1.694 |
| -1.175000000000082 | -1.266 | -1.465 | -1.684 |
| -1.170000000000082 | -1.259 | -1.456 | -1.673 |
| -1.165000000000082 | -1.251 | -1.447 | -1.662 |
| -1.160000000000082 | -1.244 | -1.438 | -1.652 |
| -1.155000000000082 | -1.237 | -1.429 | -1.641 |
| -1.150000000000082 | -1.23 | -1.421 | -1.63 |
| -1.145000000000082 | -1.223 | -1.412 | -1.62 |
| -1.140000000000082 | -1.216 | -1.403 | -1.609 |
| -1.135000000000082 | -1.209 | -1.395 | -1.599 |
| -1.130000000000082 | -1.202 | -1.386 | -1.589 |
| -1.125000000000083 | -1.195 | -1.378 | -1.578 |
| -1.120000000000083 | -1.188 | -1.369 | -1.568 |
| -1.115000000000083 | -1.181 | -1.361 | -1.558 |
| -1.110000000000083 | -1.174 | -1.352 | -1.548 |
| -1.105000000000083 | -1.167 | -1.344 | -1.538 |
| -1.100000000000083 | -1.16 | -1.336 | -1.528 |
| -1.095000000000083 | -1.153 | -1.327 | -1.518 |
| -1.090000000000083 | -1.146 | -1.319 | -1.508 |
| -1.085000000000083 | -1.139 | -1.311 | -1.498 |
| -1.080000000000084 | -1.132 | -1.303 | -1.488 |
| -1.075000000000084 | -1.126 | -1.294 | -1.478 |
| -1.070000000000084 | -1.119 | -1.286 | -1.468 |
| -1.065000000000084 | -1.112 | -1.278 | -1.458 |
| -1.060000000000084 | -1.105 | -1.27 | -1.449 |
| -1.055000000000084 | -1.099 | -1.262 | -1.439 |
| -1.050000000000084 | -1.092 | -1.254 | -1.429 |
| -1.045000000000084 | -1.085 | -1.246 | -1.42 |
| -1.040000000000084 | -1.079 | -1.238 | -1.41 |
| -1.035000000000085 | -1.072 | -1.23 | -1.401 |
| -1.030000000000085 | -1.066 | -1.222 | -1.391 |
| -1.025000000000085 | -1.059 | -1.214 | -1.382 |
| -1.020000000000085 | -1.052 | -1.206 | -1.373 |
| -1.015000000000085 | -1.046 | -1.198 | -1.363 |
| -1.010000000000085 | -1.039 | -1.191 | -1.354 |
| -1.005000000000085 | -1.033 | -1.183 | -1.345 |
| -1.000000000000085 | -1.027 | -1.175 | -1.336 |
| -0.995000000000085 | -1.02 | -1.168 | -1.326 |
| -0.990000000000085 | -1.014 | -1.16 | -1.317 |
| -0.985000000000085 | -1.007 | -1.152 | -1.308 |
| -0.980000000000085 | -1.001 | -1.145 | -1.299 |
| -0.975000000000085 | -0.995 | -1.137 | -1.29 |
| -0.970000000000085 | -0.988 | -1.129 | -1.281 |
| -0.965000000000085 | -0.982 | -1.122 | -1.272 |
| -0.960000000000085 | -0.976 | -1.114 | -1.264 |
| -0.955000000000085 | -0.969 | -1.107 | -1.255 |
| -0.950000000000085 | -0.963 | -1.099 | -1.246 |
| -0.945000000000085 | -0.957 | -1.092 | -1.237 |
| -0.940000000000085 | -0.951 | -1.085 | -1.228 |
| -0.935000000000085 | -0.944 | -1.077 | -1.22 |
| -0.930000000000085 | -0.938 | -1.07 | -1.211 |
| -0.925000000000085 | -0.932 | -1.063 | -1.202 |
| -0.920000000000085 | -0.926 | -1.055 | -1.194 |
| -0.915000000000085 | -0.92 | -1.048 | -1.185 |
| -0.910000000000085 | -0.914 | -1.041 | -1.177 |
| -0.905000000000085 | -0.908 | -1.034 | -1.168 |
| -0.900000000000085 | -0.902 | -1.027 | -1.16 |
| -0.895000000000085 | -0.895 | -1.019 | -1.151 |
| -0.890000000000085 | -0.889 | -1.012 | -1.143 |
| -0.885000000000085 | -0.883 | -1.005 | -1.135 |
| -0.880000000000085 | -0.877 | -0.998 | -1.126 |
| -0.875000000000085 | -0.871 | -0.991 | -1.118 |
| -0.870000000000085 | -0.865 | -0.984 | -1.11 |
| -0.865000000000085 | -0.86 | -0.977 | -1.102 |
| -0.860000000000085 | -0.854 | -0.97 | -1.094 |
| -0.855000000000085 | -0.848 | -0.963 | -1.085 |
| -0.850000000000085 | -0.842 | -0.956 | -1.077 |
| -0.845000000000085 | -0.836 | -0.949 | -1.069 |
| -0.840000000000085 | -0.83 | -0.942 | -1.061 |
| -0.835000000000085 | -0.824 | -0.935 | -1.053 |
| -0.830000000000085 | -0.818 | -0.929 | -1.045 |
| -0.825000000000085 | -0.813 | -0.922 | -1.037 |
| -0.820000000000085 | -0.807 | -0.915 | -1.029 |
| -0.815000000000085 | -0.801 | -0.908 | -1.022 |
| -0.810000000000085 | -0.795 | -0.902 | -1.014 |
| -0.805000000000085 | -0.79 | -0.895 | -1.006 |
| -0.800000000000085 | -0.784 | -0.888 | -0.998 |
| -0.795000000000085 | -0.778 | -0.881 | -0.99 |
| -0.790000000000085 | -0.772 | -0.875 | -0.983 |
| -0.785000000000085 | -0.767 | -0.868 | -0.975 |
| -0.780000000000085 | -0.761 | -0.862 | -0.967 |
| -0.775000000000085 | -0.755 | -0.855 | -0.96 |
| -0.770000000000085 | -0.75 | -0.848 | -0.952 |
| -0.765000000000085 | -0.744 | -0.842 | -0.944 |
| -0.760000000000085 | -0.739 | -0.835 | -0.937 |
| -0.755000000000085 | -0.733 | -0.829 | -0.929 |
| -0.750000000000085 | -0.727 | -0.822 | -0.922 |
| -0.745000000000085 | -0.722 | -0.816 | -0.914 |
| -0.740000000000085 | -0.716 | -0.809 | -0.907 |
| -0.735000000000085 | -0.711 | -0.803 | -0.9 |
| -0.730000000000085 | -0.705 | -0.797 | -0.892 |
| -0.725000000000085 | -0.7 | -0.79 | -0.885 |
| -0.720000000000085 | -0.694 | -0.784 | -0.877 |
| -0.715000000000085 | -0.689 | -0.777 | -0.87 |
| -0.710000000000085 | -0.683 | -0.771 | -0.863 |
| -0.705000000000085 | -0.678 | -0.765 | -0.856 |
| -0.700000000000085 | -0.673 | -0.759 | -0.848 |
| -0.695000000000085 | -0.667 | -0.752 | -0.841 |
| -0.690000000000085 | -0.662 | -0.746 | -0.834 |
| -0.685000000000085 | -0.656 | -0.74 | -0.827 |
| -0.680000000000085 | -0.651 | -0.734 | -0.82 |
| -0.675000000000085 | -0.646 | -0.727 | -0.813 |
| -0.670000000000085 | -0.64 | -0.721 | -0.806 |
| -0.665000000000085 | -0.635 | -0.715 | -0.799 |
| -0.660000000000085 | -0.63 | -0.709 | -0.791 |
| -0.655000000000085 | -0.624 | -0.703 | -0.784 |
| -0.650000000000085 | -0.619 | -0.697 | -0.777 |
| -0.645000000000085 | -0.614 | -0.691 | -0.771 |
| -0.640000000000085 | -0.608 | -0.685 | -0.764 |
| -0.635000000000085 | -0.603 | -0.679 | -0.757 |
| -0.630000000000085 | -0.598 | -0.673 | -0.75 |
| -0.625000000000085 | -0.593 | -0.666 | -0.743 |
| -0.620000000000085 | -0.587 | -0.66 | -0.736 |
| -0.615000000000085 | -0.582 | -0.655 | -0.729 |
| -0.610000000000085 | -0.577 | -0.649 | -0.722 |
| -0.605000000000085 | -0.572 | -0.643 | -0.716 |
| -0.600000000000085 | -0.567 | -0.637 | -0.709 |
| -0.595000000000085 | -0.561 | -0.631 | -0.702 |
| -0.590000000000085 | -0.556 | -0.625 | -0.696 |
| -0.585000000000085 | -0.551 | -0.619 | -0.689 |
| -0.580000000000085 | -0.546 | -0.613 | -0.682 |
| -0.575000000000085 | -0.541 | -0.607 | -0.676 |
| -0.570000000000085 | -0.536 | -0.601 | -0.669 |
| -0.565000000000085 | -0.531 | -0.596 | -0.662 |
| -0.560000000000085 | -0.526 | -0.59 | -0.656 |
| -0.555000000000085 | -0.521 | -0.584 | -0.649 |
| -0.550000000000085 | -0.515 | -0.578 | -0.643 |
| -0.545000000000085 | -0.51 | -0.572 | -0.636 |
| -0.540000000000085 | -0.505 | -0.567 | -0.63 |
| -0.535000000000085 | -0.5 | -0.561 | -0.623 |
| -0.530000000000085 | -0.495 | -0.555 | -0.617 |
| -0.525000000000085 | -0.49 | -0.549 | -0.61 |
| -0.520000000000085 | -0.485 | -0.544 | -0.604 |
| -0.515000000000085 | -0.48 | -0.538 | -0.597 |
| -0.510000000000085 | -0.475 | -0.532 | -0.591 |
| -0.505000000000085 | -0.47 | -0.527 | -0.585 |
| -0.500000000000085 | -0.465 | -0.521 | -0.578 |
| -0.495000000000085 | -0.46 | -0.515 | -0.572 |
| -0.490000000000085 | -0.455 | -0.51 | -0.565 |
| -0.485000000000085 | -0.45 | -0.504 | -0.559 |
| -0.480000000000085 | -0.446 | -0.499 | -0.553 |
| -0.475000000000085 | -0.441 | -0.493 | -0.547 |
| -0.470000000000085 | -0.436 | -0.487 | -0.54 |
| -0.465000000000085 | -0.431 | -0.482 | -0.534 |
| -0.460000000000085 | -0.426 | -0.476 | -0.528 |
| -0.455000000000085 | -0.421 | -0.471 | -0.522 |
| -0.450000000000085 | -0.416 | -0.465 | -0.515 |
| -0.445000000000085 | -0.411 | -0.46 | -0.509 |
| -0.440000000000085 | -0.406 | -0.454 | -0.503 |
| -0.435000000000085 | -0.402 | -0.449 | -0.497 |
| -0.430000000000085 | -0.397 | -0.443 | -0.491 |
| -0.425000000000085 | -0.392 | -0.438 | -0.485 |
| -0.420000000000085 | -0.387 | -0.432 | -0.479 |
| -0.415000000000085 | -0.382 | -0.427 | -0.473 |
| -0.410000000000085 | -0.377 | -0.422 | -0.466 |
| -0.405000000000085 | -0.373 | -0.416 | -0.46 |
| -0.400000000000085 | -0.368 | -0.411 | -0.454 |
| -0.395000000000085 | -0.363 | -0.405 | -0.448 |
| -0.390000000000085 | -0.358 | -0.4 | -0.442 |
| -0.385000000000085 | -0.353 | -0.395 | -0.436 |
| -0.380000000000085 | -0.349 | -0.389 | -0.43 |
| -0.375000000000085 | -0.344 | -0.384 | -0.424 |
| -0.370000000000085 | -0.339 | -0.379 | -0.418 |
| -0.365000000000085 | -0.334 | -0.373 | -0.412 |
| -0.360000000000085 | -0.33 | -0.368 | -0.406 |
| -0.355000000000085 | -0.325 | -0.363 | -0.401 |
| -0.350000000000085 | -0.32 | -0.357 | -0.395 |
| -0.345000000000085 | -0.316 | -0.352 | -0.389 |
| -0.340000000000085 | -0.311 | -0.347 | -0.383 |
| -0.335000000000085 | -0.306 | -0.341 | -0.377 |
| -0.330000000000085 | -0.301 | -0.336 | -0.371 |
| -0.325000000000085 | -0.297 | -0.331 | -0.365 |
| -0.320000000000085 | -0.292 | -0.325 | -0.359 |
| -0.315000000000085 | -0.287 | -0.32 | -0.353 |
| -0.310000000000085 | -0.283 | -0.315 | -0.348 |
| -0.305000000000085 | -0.278 | -0.31 | -0.342 |
| -0.300000000000085 | -0.273 | -0.305 | -0.336 |
| -0.295000000000085 | -0.269 | -0.299 | -0.33 |
| -0.290000000000085 | -0.264 | -0.294 | -0.324 |
| -0.285000000000085 | -0.259 | -0.289 | -0.319 |
| -0.280000000000085 | -0.255 | -0.284 | -0.313 |
| -0.275000000000085 | -0.25 | -0.278 | -0.307 |
| -0.270000000000085 | -0.245 | -0.273 | -0.301 |
| -0.265000000000085 | -0.241 | -0.268 | -0.296 |
| -0.260000000000085 | -0.236 | -0.263 | -0.29 |
| -0.255000000000085 | -0.232 | -0.258 | -0.284 |
| -0.250000000000085 | -0.227 | -0.253 | -0.278 |
| -0.245000000000085 | -0.222 | -0.247 | -0.273 |
| -0.240000000000085 | -0.218 | -0.242 | -0.267 |
| -0.235000000000085 | -0.213 | -0.237 | -0.261 |
| -0.230000000000085 | -0.208 | -0.232 | -0.256 |
| -0.225000000000085 | -0.204 | -0.227 | -0.25 |
| -0.220000000000085 | -0.199 | -0.222 | -0.244 |
| -0.215000000000085 | -0.195 | -0.217 | -0.239 |
| -0.210000000000085 | -0.19 | -0.212 | -0.233 |
| -0.205000000000085 | -0.186 | -0.206 | -0.227 |
| -0.200000000000085 | -0.181 | -0.201 | -0.222 |
| -0.195000000000085 | -0.176 | -0.196 | -0.216 |
| -0.190000000000085 | -0.172 | -0.191 | -0.211 |
| -0.185000000000085 | -0.167 | -0.186 | -0.205 |
| -0.180000000000085 | -0.163 | -0.181 | -0.199 |
| -0.175000000000085 | -0.158 | -0.176 | -0.194 |
| -0.170000000000085 | -0.154 | -0.171 | -0.188 |
| -0.165000000000085 | -0.149 | -0.166 | -0.182 |
| -0.160000000000085 | -0.144 | -0.161 | -0.177 |
| -0.155000000000084 | -0.14 | -0.156 | -0.171 |
| -0.150000000000084 | -0.135 | -0.151 | -0.166 |
| -0.145000000000084 | -0.131 | -0.146 | -0.16 |
| -0.140000000000084 | -0.126 | -0.14 | -0.155 |
| -0.135000000000084 | -0.122 | -0.135 | -0.149 |
| -0.130000000000084 | -0.117 | -0.13 | -0.143 |
| -0.125000000000084 | -0.113 | -0.125 | -0.138 |
| -0.120000000000084 | -0.108 | -0.12 | -0.132 |
| -0.115000000000084 | -0.104 | -0.115 | -0.127 |
| -0.110000000000084 | -0.099 | -0.11 | -0.121 |
| -0.105000000000084 | -0.095 | -0.105 | -0.116 |
| -0.100000000000084 | -0.09 | -0.1 | -0.11 |
| -0.0950000000000844 | -0.086 | -0.095 | -0.105 |
| -0.0900000000000844 | -0.081 | -0.09 | -0.099 |
| -0.0850000000000844 | -0.077 | -0.085 | -0.094 |
| -0.0800000000000844 | -0.072 | -0.08 | -0.088 |
| -0.0750000000000844 | -0.068 | -0.075 | -0.083 |
| -0.0700000000000844 | -0.063 | -0.07 | -0.077 |
| -0.0650000000000844 | -0.059 | -0.065 | -0.072 |
| -0.0600000000000844 | -0.054 | -0.06 | -0.066 |
| -0.0550000000000844 | -0.05 | -0.055 | -0.061 |
| -0.0500000000000844 | -0.045 | -0.05 | -0.055 |
| -0.0450000000000844 | -0.041 | -0.045 | -0.05 |
| -0.0400000000000844 | -0.036 | -0.04 | -0.044 |
| -0.0350000000000844 | -0.032 | -0.035 | -0.039 |
| -0.0300000000000844 | -0.027 | -0.03 | -0.033 |
| -0.0250000000000844 | -0.023 | -0.025 | -0.028 |
| -0.0200000000000844 | -0.018 | -0.02 | -0.022 |
| -0.0150000000000844 | -0.014 | -0.015 | -0.017 |
| -0.0100000000000844 | -0.009 | -0.01 | -0.011 |
| -0.00500000000008444 | -0.005 | -0.005 | -0.006 |
| -8.4444604087075e-14 | 0 | 0 | 0 |
| 0.00499999999991555 | 0.005 | 0.005 | 0.006 |
| 0.00999999999991555 | 0.009 | 0.01 | 0.011 |
| 0.0149999999999156 | 0.014 | 0.015 | 0.017 |
| 0.0199999999999156 | 0.018 | 0.02 | 0.022 |
| 0.0249999999999156 | 0.023 | 0.025 | 0.028 |
| 0.0299999999999156 | 0.027 | 0.03 | 0.033 |
| 0.0349999999999155 | 0.032 | 0.035 | 0.039 |
| 0.0399999999999155 | 0.036 | 0.04 | 0.044 |
| 0.0449999999999155 | 0.041 | 0.045 | 0.05 |
| 0.0499999999999155 | 0.045 | 0.05 | 0.055 |
| 0.0549999999999155 | 0.05 | 0.055 | 0.061 |
| 0.0599999999999155 | 0.054 | 0.06 | 0.066 |
| 0.0649999999999155 | 0.059 | 0.065 | 0.072 |
| 0.0699999999999155 | 0.063 | 0.07 | 0.077 |
| 0.0749999999999155 | 0.068 | 0.075 | 0.083 |
| 0.0799999999999155 | 0.072 | 0.08 | 0.088 |
| 0.0849999999999155 | 0.077 | 0.085 | 0.094 |
| 0.0899999999999155 | 0.081 | 0.09 | 0.099 |
| 0.0949999999999155 | 0.086 | 0.095 | 0.105 |
| 0.0999999999999155 | 0.09 | 0.1 | 0.11 |
| 0.104999999999916 | 0.095 | 0.105 | 0.116 |
| 0.109999999999916 | 0.099 | 0.11 | 0.121 |
| 0.114999999999916 | 0.104 | 0.115 | 0.127 |
| 0.119999999999916 | 0.108 | 0.12 | 0.132 |
| 0.124999999999916 | 0.113 | 0.125 | 0.138 |
| 0.129999999999916 | 0.117 | 0.13 | 0.143 |
| 0.134999999999916 | 0.122 | 0.135 | 0.149 |
| 0.139999999999916 | 0.126 | 0.14 | 0.155 |
| 0.144999999999916 | 0.131 | 0.146 | 0.16 |
| 0.149999999999916 | 0.135 | 0.151 | 0.166 |
| 0.154999999999916 | 0.14 | 0.156 | 0.171 |
| 0.159999999999916 | 0.144 | 0.161 | 0.177 |
| 0.164999999999916 | 0.149 | 0.166 | 0.182 |
| 0.169999999999916 | 0.154 | 0.171 | 0.188 |
| 0.174999999999916 | 0.158 | 0.176 | 0.194 |
| 0.179999999999916 | 0.163 | 0.181 | 0.199 |
| 0.184999999999916 | 0.167 | 0.186 | 0.205 |
| 0.189999999999916 | 0.172 | 0.191 | 0.211 |
| 0.194999999999916 | 0.176 | 0.196 | 0.216 |
| 0.199999999999916 | 0.181 | 0.201 | 0.222 |
| 0.204999999999916 | 0.186 | 0.206 | 0.227 |
| 0.209999999999916 | 0.19 | 0.212 | 0.233 |
| 0.214999999999916 | 0.195 | 0.217 | 0.239 |
| 0.219999999999916 | 0.199 | 0.222 | 0.244 |
| 0.224999999999916 | 0.204 | 0.227 | 0.25 |
| 0.229999999999916 | 0.208 | 0.232 | 0.256 |
| 0.234999999999916 | 0.213 | 0.237 | 0.261 |
| 0.239999999999916 | 0.218 | 0.242 | 0.267 |
| 0.244999999999916 | 0.222 | 0.247 | 0.273 |
| 0.249999999999916 | 0.227 | 0.253 | 0.278 |
| 0.254999999999916 | 0.232 | 0.258 | 0.284 |
| 0.259999999999916 | 0.236 | 0.263 | 0.29 |
| 0.264999999999916 | 0.241 | 0.268 | 0.296 |
| 0.269999999999916 | 0.245 | 0.273 | 0.301 |
| 0.274999999999916 | 0.25 | 0.278 | 0.307 |
| 0.279999999999916 | 0.255 | 0.284 | 0.313 |
| 0.284999999999916 | 0.259 | 0.289 | 0.319 |
| 0.289999999999916 | 0.264 | 0.294 | 0.324 |
| 0.294999999999916 | 0.269 | 0.299 | 0.33 |
| 0.299999999999916 | 0.273 | 0.305 | 0.336 |
| 0.304999999999916 | 0.278 | 0.31 | 0.342 |
| 0.309999999999916 | 0.283 | 0.315 | 0.348 |
| 0.314999999999916 | 0.287 | 0.32 | 0.353 |
| 0.319999999999916 | 0.292 | 0.325 | 0.359 |
| 0.324999999999916 | 0.297 | 0.331 | 0.365 |
| 0.329999999999916 | 0.301 | 0.336 | 0.371 |
| 0.334999999999916 | 0.306 | 0.341 | 0.377 |
| 0.339999999999916 | 0.311 | 0.347 | 0.383 |
| 0.344999999999916 | 0.316 | 0.352 | 0.389 |
| 0.349999999999916 | 0.32 | 0.357 | 0.395 |
| 0.354999999999916 | 0.325 | 0.363 | 0.401 |
| 0.359999999999916 | 0.33 | 0.368 | 0.406 |
| 0.364999999999916 | 0.334 | 0.373 | 0.412 |
| 0.369999999999916 | 0.339 | 0.379 | 0.418 |
| 0.374999999999916 | 0.344 | 0.384 | 0.424 |
| 0.379999999999916 | 0.349 | 0.389 | 0.43 |
| 0.384999999999916 | 0.353 | 0.395 | 0.436 |
| 0.389999999999916 | 0.358 | 0.4 | 0.442 |
| 0.394999999999916 | 0.363 | 0.405 | 0.448 |
| 0.399999999999916 | 0.368 | 0.411 | 0.454 |
| 0.404999999999916 | 0.373 | 0.416 | 0.46 |
| 0.409999999999916 | 0.377 | 0.422 | 0.466 |
| 0.414999999999916 | 0.382 | 0.427 | 0.473 |
| 0.419999999999916 | 0.387 | 0.432 | 0.479 |
| 0.424999999999916 | 0.392 | 0.438 | 0.485 |
| 0.429999999999916 | 0.397 | 0.443 | 0.491 |
| 0.434999999999916 | 0.402 | 0.449 | 0.497 |
| 0.439999999999916 | 0.406 | 0.454 | 0.503 |
| 0.444999999999916 | 0.411 | 0.46 | 0.509 |
| 0.449999999999916 | 0.416 | 0.465 | 0.515 |
| 0.454999999999916 | 0.421 | 0.471 | 0.522 |
| 0.459999999999916 | 0.426 | 0.476 | 0.528 |
| 0.464999999999916 | 0.431 | 0.482 | 0.534 |
| 0.469999999999916 | 0.436 | 0.487 | 0.54 |
| 0.474999999999916 | 0.441 | 0.493 | 0.547 |
| 0.479999999999916 | 0.446 | 0.499 | 0.553 |
| 0.484999999999916 | 0.45 | 0.504 | 0.559 |
| 0.489999999999916 | 0.455 | 0.51 | 0.565 |
| 0.494999999999916 | 0.46 | 0.515 | 0.572 |
| 0.499999999999916 | 0.465 | 0.521 | 0.578 |
| 0.504999999999916 | 0.47 | 0.527 | 0.585 |
| 0.509999999999916 | 0.475 | 0.532 | 0.591 |
| 0.514999999999916 | 0.48 | 0.538 | 0.597 |
| 0.519999999999916 | 0.485 | 0.544 | 0.604 |
| 0.524999999999916 | 0.49 | 0.549 | 0.61 |
| 0.529999999999916 | 0.495 | 0.555 | 0.617 |
| 0.534999999999916 | 0.5 | 0.561 | 0.623 |
| 0.539999999999916 | 0.505 | 0.567 | 0.63 |
| 0.544999999999916 | 0.51 | 0.572 | 0.636 |
| 0.549999999999916 | 0.515 | 0.578 | 0.643 |
| 0.554999999999916 | 0.521 | 0.584 | 0.649 |
| 0.559999999999916 | 0.526 | 0.59 | 0.656 |
| 0.564999999999916 | 0.531 | 0.596 | 0.662 |
| 0.569999999999916 | 0.536 | 0.601 | 0.669 |
| 0.574999999999916 | 0.541 | 0.607 | 0.676 |
| 0.579999999999916 | 0.546 | 0.613 | 0.682 |
| 0.584999999999916 | 0.551 | 0.619 | 0.689 |
| 0.589999999999916 | 0.556 | 0.625 | 0.696 |
| 0.594999999999916 | 0.561 | 0.631 | 0.702 |
| 0.599999999999916 | 0.567 | 0.637 | 0.709 |
| 0.604999999999916 | 0.572 | 0.643 | 0.716 |
| 0.609999999999916 | 0.577 | 0.649 | 0.722 |
| 0.614999999999916 | 0.582 | 0.655 | 0.729 |
| 0.619999999999916 | 0.587 | 0.66 | 0.736 |
| 0.624999999999916 | 0.593 | 0.666 | 0.743 |
| 0.629999999999916 | 0.598 | 0.673 | 0.75 |
| 0.634999999999916 | 0.603 | 0.679 | 0.757 |
| 0.639999999999916 | 0.608 | 0.685 | 0.764 |
| 0.644999999999916 | 0.614 | 0.691 | 0.771 |
| 0.649999999999916 | 0.619 | 0.697 | 0.777 |
| 0.654999999999916 | 0.624 | 0.703 | 0.784 |
| 0.659999999999916 | 0.63 | 0.709 | 0.791 |
| 0.664999999999916 | 0.635 | 0.715 | 0.799 |
| 0.669999999999916 | 0.64 | 0.721 | 0.806 |
| 0.674999999999916 | 0.646 | 0.727 | 0.813 |
| 0.679999999999916 | 0.651 | 0.734 | 0.82 |
| 0.684999999999916 | 0.656 | 0.74 | 0.827 |
| 0.689999999999916 | 0.662 | 0.746 | 0.834 |
| 0.694999999999916 | 0.667 | 0.752 | 0.841 |
| 0.699999999999916 | 0.673 | 0.759 | 0.848 |
| 0.704999999999916 | 0.678 | 0.765 | 0.856 |
| 0.709999999999916 | 0.683 | 0.771 | 0.863 |
| 0.714999999999916 | 0.689 | 0.777 | 0.87 |
| 0.719999999999916 | 0.694 | 0.784 | 0.877 |
| 0.724999999999916 | 0.7 | 0.79 | 0.885 |
| 0.729999999999916 | 0.705 | 0.797 | 0.892 |
| 0.734999999999916 | 0.711 | 0.803 | 0.9 |
| 0.739999999999916 | 0.716 | 0.809 | 0.907 |
| 0.744999999999916 | 0.722 | 0.816 | 0.914 |
| 0.749999999999916 | 0.727 | 0.822 | 0.922 |
| 0.754999999999916 | 0.733 | 0.829 | 0.929 |
| 0.759999999999916 | 0.739 | 0.835 | 0.937 |
| 0.764999999999916 | 0.744 | 0.842 | 0.944 |
| 0.769999999999916 | 0.75 | 0.848 | 0.952 |
| 0.774999999999916 | 0.755 | 0.855 | 0.96 |
| 0.779999999999916 | 0.761 | 0.862 | 0.967 |
| 0.784999999999916 | 0.767 | 0.868 | 0.975 |
| 0.789999999999916 | 0.772 | 0.875 | 0.983 |
| 0.794999999999916 | 0.778 | 0.881 | 0.99 |
| 0.799999999999916 | 0.784 | 0.888 | 0.998 |
| 0.804999999999916 | 0.79 | 0.895 | 1.006 |
| 0.809999999999916 | 0.795 | 0.902 | 1.014 |
| 0.814999999999916 | 0.801 | 0.908 | 1.022 |
| 0.819999999999916 | 0.807 | 0.915 | 1.029 |
| 0.824999999999916 | 0.813 | 0.922 | 1.037 |
| 0.829999999999916 | 0.818 | 0.929 | 1.045 |
| 0.834999999999916 | 0.824 | 0.935 | 1.053 |
| 0.839999999999916 | 0.83 | 0.942 | 1.061 |
| 0.844999999999916 | 0.836 | 0.949 | 1.069 |
| 0.849999999999916 | 0.842 | 0.956 | 1.077 |
| 0.854999999999916 | 0.848 | 0.963 | 1.085 |
| 0.859999999999916 | 0.854 | 0.97 | 1.094 |
| 0.864999999999916 | 0.86 | 0.977 | 1.102 |
| 0.869999999999916 | 0.865 | 0.984 | 1.11 |
| 0.874999999999916 | 0.871 | 0.991 | 1.118 |
| 0.879999999999916 | 0.877 | 0.998 | 1.126 |
| 0.884999999999916 | 0.883 | 1.005 | 1.135 |
| 0.889999999999916 | 0.889 | 1.012 | 1.143 |
| 0.894999999999916 | 0.895 | 1.019 | 1.151 |
| 0.899999999999916 | 0.902 | 1.027 | 1.16 |
| 0.904999999999916 | 0.908 | 1.034 | 1.168 |
| 0.909999999999916 | 0.914 | 1.041 | 1.177 |
| 0.914999999999916 | 0.92 | 1.048 | 1.185 |
| 0.919999999999916 | 0.926 | 1.055 | 1.194 |
| 0.924999999999916 | 0.932 | 1.063 | 1.202 |
| 0.929999999999916 | 0.938 | 1.07 | 1.211 |
| 0.934999999999916 | 0.944 | 1.077 | 1.22 |
| 0.939999999999916 | 0.951 | 1.085 | 1.228 |
| 0.944999999999916 | 0.957 | 1.092 | 1.237 |
| 0.949999999999916 | 0.963 | 1.099 | 1.246 |
| 0.954999999999916 | 0.969 | 1.107 | 1.255 |
| 0.959999999999916 | 0.976 | 1.114 | 1.264 |
| 0.964999999999916 | 0.982 | 1.122 | 1.272 |
| 0.969999999999916 | 0.988 | 1.129 | 1.281 |
| 0.974999999999916 | 0.995 | 1.137 | 1.29 |
| 0.979999999999916 | 1.001 | 1.145 | 1.299 |
| 0.984999999999916 | 1.007 | 1.152 | 1.308 |
| 0.989999999999916 | 1.014 | 1.16 | 1.317 |
| 0.994999999999916 | 1.02 | 1.168 | 1.326 |
| 0.999999999999916 | 1.027 | 1.175 | 1.336 |
| 1.004999999999916 | 1.033 | 1.183 | 1.345 |
| 1.009999999999916 | 1.039 | 1.191 | 1.354 |
| 1.014999999999916 | 1.046 | 1.198 | 1.363 |
| 1.019999999999916 | 1.052 | 1.206 | 1.373 |
| 1.024999999999916 | 1.059 | 1.214 | 1.382 |
| 1.029999999999916 | 1.066 | 1.222 | 1.391 |
| 1.034999999999916 | 1.072 | 1.23 | 1.401 |
| 1.039999999999915 | 1.079 | 1.238 | 1.41 |
| 1.044999999999915 | 1.085 | 1.246 | 1.42 |
| 1.049999999999915 | 1.092 | 1.254 | 1.429 |
| 1.054999999999915 | 1.099 | 1.262 | 1.439 |
| 1.059999999999915 | 1.105 | 1.27 | 1.449 |
| 1.064999999999915 | 1.112 | 1.278 | 1.458 |
| 1.069999999999915 | 1.119 | 1.286 | 1.468 |
| 1.074999999999915 | 1.126 | 1.294 | 1.478 |
| 1.079999999999915 | 1.132 | 1.303 | 1.488 |
| 1.084999999999914 | 1.139 | 1.311 | 1.498 |
| 1.089999999999914 | 1.146 | 1.319 | 1.508 |
| 1.094999999999914 | 1.153 | 1.327 | 1.518 |
| 1.099999999999914 | 1.16 | 1.336 | 1.528 |
| 1.104999999999914 | 1.167 | 1.344 | 1.538 |
| 1.109999999999914 | 1.174 | 1.352 | 1.548 |
| 1.114999999999914 | 1.181 | 1.361 | 1.558 |
| 1.119999999999914 | 1.188 | 1.369 | 1.568 |
| 1.124999999999914 | 1.195 | 1.378 | 1.578 |
| 1.129999999999914 | 1.202 | 1.386 | 1.589 |
| 1.134999999999913 | 1.209 | 1.395 | 1.599 |
| 1.139999999999913 | 1.216 | 1.403 | 1.609 |
| 1.144999999999913 | 1.223 | 1.412 | 1.62 |
| 1.149999999999913 | 1.23 | 1.421 | 1.63 |
| 1.154999999999913 | 1.237 | 1.429 | 1.641 |
| 1.159999999999913 | 1.244 | 1.438 | 1.652 |
| 1.164999999999913 | 1.251 | 1.447 | 1.662 |
| 1.169999999999913 | 1.259 | 1.456 | 1.673 |
| 1.174999999999913 | 1.266 | 1.465 | 1.684 |
| 1.179999999999912 | 1.273 | 1.474 | 1.694 |
| 1.184999999999912 | 1.28 | 1.482 | 1.705 |
| 1.189999999999912 | 1.288 | 1.491 | 1.716 |
| 1.194999999999912 | 1.295 | 1.5 | 1.727 |
| 1.199999999999912 | 1.303 | 1.509 | 1.738 |
| 1.204999999999912 | 1.31 | 1.519 | 1.749 |
| 1.209999999999912 | 1.317 | 1.528 | 1.76 |
| 1.214999999999912 | 1.325 | 1.537 | 1.771 |
| 1.219999999999912 | 1.332 | 1.546 | 1.783 |
| 1.224999999999911 | 1.34 | 1.555 | 1.794 |
| 1.229999999999911 | 1.347 | 1.564 | 1.805 |
| 1.234999999999911 | 1.355 | 1.574 | 1.817 |
| 1.239999999999911 | 1.363 | 1.583 | 1.828 |
| 1.244999999999911 | 1.37 | 1.592 | 1.84 |
| 1.249999999999911 | 1.378 | 1.602 | 1.851 |
| 1.254999999999911 | 1.385 | 1.611 | 1.863 |
| 1.259999999999911 | 1.393 | 1.621 | 1.874 |
| 1.264999999999911 | 1.401 | 1.63 | 1.886 |
| 1.269999999999911 | 1.409 | 1.64 | 1.898 |
| 1.27499999999991 | 1.416 | 1.65 | 1.91 |
| 1.27999999999991 | 1.424 | 1.659 | 1.922 |
| 1.28499999999991 | 1.432 | 1.669 | 1.934 |
| 1.28999999999991 | 1.44 | 1.679 | 1.946 |
| 1.29499999999991 | 1.448 | 1.689 | 1.958 |
| 1.29999999999991 | 1.456 | 1.698 | 1.97 |
| 1.30499999999991 | 1.464 | 1.708 | 1.982 |
| 1.30999999999991 | 1.472 | 1.718 | 1.994 |
| 1.31499999999991 | 1.48 | 1.728 | 2.006 |
| 1.319999999999909 | 1.488 | 1.738 | 2.019 |
| 1.324999999999909 | 1.496 | 1.748 | 2.031 |
| 1.329999999999909 | 1.504 | 1.758 | 2.044 |
| 1.334999999999909 | 1.512 | 1.768 | 2.056 |
| 1.339999999999909 | 1.52 | 1.779 | 2.069 |
| 1.344999999999909 | 1.529 | 1.789 | 2.081 |
| 1.349999999999909 | 1.537 | 1.799 | 2.094 |
| 1.354999999999909 | 1.545 | 1.809 | 2.107 |
| 1.359999999999909 | 1.553 | 1.82 | 2.12 |
| 1.364999999999908 | 1.562 | 1.83 | 2.133 |
| 1.369999999999908 | 1.57 | 1.841 | 2.146 |
| 1.374999999999908 | 1.578 | 1.851 | 2.159 |
| 1.379999999999908 | 1.587 | 1.862 | 2.172 |
| 1.384999999999908 | 1.595 | 1.872 | 2.185 |
| 1.389999999999908 | 1.604 | 1.883 | 2.198 |
| 1.394999999999908 | 1.612 | 1.894 | 2.212 |
| 1.399999999999908 | 1.621 | 1.904 | 2.225 |
| 1.404999999999908 | 1.629 | 1.915 | 2.239 |
| 1.409999999999908 | 1.638 | 1.926 | 2.252 |
| 1.414999999999907 | 1.647 | 1.937 | 2.266 |
| 1.419999999999907 | 1.655 | 1.948 | 2.279 |
| 1.424999999999907 | 1.664 | 1.959 | 2.293 |
| 1.429999999999907 | 1.673 | 1.97 | 2.307 |
| 1.434999999999907 | 1.682 | 1.981 | 2.321 |
| 1.439999999999907 | 1.691 | 1.992 | 2.335 |
| 1.444999999999907 | 1.699 | 2.003 | 2.349 |
| 1.449999999999907 | 1.708 | 2.014 | 2.363 |
| 1.454999999999907 | 1.717 | 2.026 | 2.377 |
| 1.459999999999906 | 1.726 | 2.037 | 2.391 |
| 1.464999999999906 | 1.735 | 2.048 | 2.405 |
| 1.469999999999906 | 1.744 | 2.06 | 2.42 |
| 1.474999999999906 | 1.753 | 2.071 | 2.434 |
| 1.479999999999906 | 1.762 | 2.083 | 2.449 |
| 1.484999999999906 | 1.771 | 2.094 | 2.463 |
| 1.489999999999906 | 1.781 | 2.106 | 2.478 |
| 1.494999999999906 | 1.79 | 2.118 | 2.493 |
| 1.499999999999906 | 1.799 | 2.129 | 2.507 |
| 1.504999999999906 | 1.808 | 2.141 | 2.522 |
| 1.509999999999905 | 1.818 | 2.153 | 2.537 |
| 1.514999999999905 | 1.827 | 2.165 | 2.552 |
| 1.519999999999905 | 1.836 | 2.177 | 2.567 |
| 1.524999999999905 | 1.846 | 2.189 | 2.583 |
| 1.529999999999905 | 1.855 | 2.201 | 2.598 |
| 1.534999999999905 | 1.865 | 2.213 | 2.613 |
| 1.539999999999905 | 1.874 | 2.225 | 2.629 |
| 1.544999999999905 | 1.884 | 2.237 | 2.644 |
| 1.549999999999905 | 1.894 | 2.25 | 2.66 |
| 1.554999999999904 | 1.903 | 2.262 | 2.675 |
| 1.559999999999904 | 1.913 | 2.274 | 2.691 |
| 1.564999999999904 | 1.923 | 2.287 | 2.707 |
| 1.569999999999904 | 1.932 | 2.299 | 2.723 |
| 1.574999999999904 | 1.942 | 2.312 | 2.739 |
| 1.579999999999904 | 1.952 | 2.324 | 2.755 |
| 1.584999999999904 | 1.962 | 2.337 | 2.771 |
| 1.589999999999904 | 1.972 | 2.35 | 2.787 |
| 1.594999999999904 | 1.982 | 2.363 | 2.804 |
| 1.599999999999903 | 1.992 | 2.376 | 2.82 |
| 1.604999999999903 | 2.002 | 2.388 | 2.837 |
| 1.609999999999903 | 2.012 | 2.401 | 2.853 |
| 1.614999999999903 | 2.022 | 2.414 | 2.87 |
| 1.619999999999903 | 2.032 | 2.428 | 2.887 |
| 1.624999999999903 | 2.043 | 2.441 | 2.904 |
| 1.629999999999903 | 2.053 | 2.454 | 2.92 |
| 1.634999999999903 | 2.063 | 2.467 | 2.938 |
| 1.639999999999903 | 2.073 | 2.481 | 2.955 |
| 1.644999999999902 | 2.084 | 2.494 | 2.972 |
| 1.649999999999902 | 2.094 | 2.507 | 2.989 |
| 1.654999999999902 | 2.105 | 2.521 | 3.007 |
| 1.659999999999902 | 2.115 | 2.535 | 3.024 |
| 1.664999999999902 | 2.126 | 2.548 | 3.042 |
| 1.669999999999902 | 2.136 | 2.562 | 3.059 |
| 1.674999999999902 | 2.147 | 2.576 | 3.077 |
| 1.679999999999902 | 2.158 | 2.59 | 3.095 |
| 1.684999999999902 | 2.168 | 2.604 | 3.113 |
| 1.689999999999901 | 2.179 | 2.617 | 3.131 |
| 1.694999999999901 | 2.19 | 2.632 | 3.149 |
| 1.699999999999901 | 2.201 | 2.646 | 3.167 |
| 1.704999999999901 | 2.212 | 2.66 | 3.185 |
| 1.709999999999901 | 2.223 | 2.674 | 3.204 |
| 1.714999999999901 | 2.234 | 2.688 | 3.222 |
| 1.719999999999901 | 2.245 | 2.703 | 3.241 |
| 1.724999999999901 | 2.256 | 2.717 | 3.26 |
| 1.729999999999901 | 2.267 | 2.732 | 3.278 |
| 1.734999999999901 | 2.278 | 2.746 | 3.297 |
| 1.7399999999999 | 2.289 | 2.761 | 3.316 |
| 1.7449999999999 | 2.301 | 2.776 | 3.335 |
| 1.7499999999999 | 2.312 | 2.79 | 3.355 |
| 1.7549999999999 | 2.323 | 2.805 | 3.374 |
| 1.7599999999999 | 2.335 | 2.82 | 3.393 |
| 1.7649999999999 | 2.346 | 2.835 | 3.413 |
| 1.7699999999999 | 2.358 | 2.85 | 3.432 |
| 1.7749999999999 | 2.369 | 2.865 | 3.452 |
| 1.7799999999999 | 2.381 | 2.881 | 3.472 |
| 1.784999999999899 | 2.392 | 2.896 | 3.492 |
| 1.789999999999899 | 2.404 | 2.911 | 3.512 |
| 1.794999999999899 | 2.416 | 2.927 | 3.532 |
| 1.799999999999899 | 2.428 | 2.942 | 3.552 |
| 1.804999999999899 | 2.439 | 2.958 | 3.573 |
| 1.809999999999899 | 2.451 | 2.973 | 3.593 |
| 1.814999999999899 | 2.463 | 2.989 | 3.614 |
| 1.819999999999899 | 2.475 | 3.005 | 3.634 |
| 1.824999999999899 | 2.487 | 3.021 | 3.655 |
| 1.829999999999899 | 2.499 | 3.037 | 3.676 |
| 1.834999999999898 | 2.512 | 3.053 | 3.697 |
| 1.839999999999898 | 2.524 | 3.069 | 3.718 |
| 1.844999999999898 | 2.536 | 3.085 | 3.739 |
| 1.849999999999898 | 2.548 | 3.101 | 3.761 |
| 1.854999999999898 | 2.561 | 3.118 | 3.782 |
| 1.859999999999898 | 2.573 | 3.134 | 3.804 |
| 1.864999999999898 | 2.585 | 3.151 | 3.826 |
| 1.869999999999898 | 2.598 | 3.167 | 3.847 |
| 1.874999999999898 | 2.61 | 3.184 | 3.869 |
| 1.879999999999897 | 2.623 | 3.2 | 3.891 |
| 1.884999999999897 | 2.636 | 3.217 | 3.913 |
| 1.889999999999897 | 2.648 | 3.234 | 3.936 |
| 1.894999999999897 | 2.661 | 3.251 | 3.958 |
| 1.899999999999897 | 2.674 | 3.268 | 3.981 |
| 1.904999999999897 | 2.687 | 3.285 | 4.003 |
| 1.909999999999897 | 2.7 | 3.303 | 4.026 |
| 1.914999999999897 | 2.713 | 3.32 | 4.049 |
| 1.919999999999897 | 2.726 | 3.337 | 4.072 |
| 1.924999999999897 | 2.739 | 3.355 | 4.095 |
| 1.929999999999896 | 2.752 | 3.372 | 4.118 |
| 1.934999999999896 | 2.765 | 3.39 | 4.142 |
| 1.939999999999896 | 2.779 | 3.408 | 4.165 |
| 1.944999999999896 | 2.792 | 3.425 | 4.189 |
| 1.949999999999896 | 2.805 | 3.443 | 4.212 |
| 1.954999999999896 | 2.819 | 3.461 | 4.236 |
| 1.959999999999896 | 2.832 | 3.479 | 4.26 |
| 1.964999999999896 | 2.846 | 3.497 | 4.285 |
| 1.969999999999896 | 2.859 | 3.516 | 4.309 |
| 1.974999999999895 | 2.873 | 3.534 | 4.333 |
| 1.979999999999895 | 2.887 | 3.552 | 4.358 |
| 1.984999999999895 | 2.9 | 3.571 | 4.382 |
| 1.989999999999895 | 2.914 | 3.589 | 4.407 |
| 1.994999999999895 | 2.928 | 3.608 | 4.432 |
| 1.999999999999895 | 2.942 | 3.627 | 4.457 |
| 2.004999999999895 | 2.956 | 3.646 | 4.482 |
| 2.009999999999895 | 2.97 | 3.665 | 4.508 |
| 2.014999999999895 | 2.984 | 3.684 | 4.533 |
| 2.019999999999895 | 2.999 | 3.703 | 4.559 |
| 2.024999999999895 | 3.013 | 3.722 | 4.584 |
| 2.029999999999895 | 3.027 | 3.741 | 4.61 |
| 2.034999999999894 | 3.042 | 3.761 | 4.636 |
| 2.039999999999894 | 3.056 | 3.78 | 4.662 |
| 2.044999999999894 | 3.07 | 3.8 | 4.689 |
| 2.049999999999894 | 3.085 | 3.82 | 4.715 |
| 2.054999999999894 | 3.1 | 3.839 | 4.742 |
| 2.059999999999894 | 3.114 | 3.859 | 4.769 |
| 2.064999999999894 | 3.129 | 3.879 | 4.795 |
| 2.069999999999894 | 3.144 | 3.899 | 4.822 |
| 2.074999999999894 | 3.159 | 3.919 | 4.85 |
| 2.079999999999893 | 3.174 | 3.94 | 4.877 |
| 2.084999999999893 | 3.189 | 3.96 | 4.904 |
| 2.089999999999893 | 3.204 | 3.981 | 4.932 |
| 2.094999999999893 | 3.219 | 4.001 | 4.96 |
| 2.099999999999893 | 3.234 | 4.022 | 4.988 |
| 2.104999999999893 | 3.249 | 4.043 | 5.016 |
| 2.109999999999893 | 3.265 | 4.064 | 5.044 |
| 2.114999999999893 | 3.28 | 4.084 | 5.072 |
| 2.119999999999893 | 3.296 | 4.106 | 5.101 |
| 2.124999999999893 | 3.311 | 4.127 | 5.129 |
| 2.129999999999892 | 3.327 | 4.148 | 5.158 |
| 2.134999999999892 | 3.342 | 4.169 | 5.187 |
| 2.139999999999892 | 3.358 | 4.191 | 5.216 |
| 2.144999999999892 | 3.374 | 4.212 | 5.246 |
| 2.149999999999892 | 3.39 | 4.234 | 5.275 |
| 2.154999999999892 | 3.406 | 4.256 | 5.305 |
| 2.159999999999892 | 3.422 | 4.278 | 5.334 |
| 2.164999999999892 | 3.438 | 4.3 | 5.364 |
| 2.169999999999892 | 3.454 | 4.322 | 5.394 |
| 2.174999999999891 | 3.47 | 4.344 | 5.425 |
| 2.179999999999891 | 3.486 | 4.367 | 5.455 |
| 2.184999999999891 | 3.503 | 4.389 | 5.486 |
| 2.189999999999891 | 3.519 | 4.412 | 5.516 |
| 2.194999999999891 | 3.536 | 4.434 | 5.547 |
| 2.199999999999891 | 3.552 | 4.457 | 5.578 |
| 2.204999999999891 | 3.569 | 4.48 | 5.61 |
| 2.209999999999891 | 3.586 | 4.503 | 5.641 |
| 2.214999999999891 | 3.602 | 4.526 | 5.673 |
| 2.21999999999989 | 3.619 | 4.549 | 5.705 |
| 2.22499999999989 | 3.636 | 4.573 | 5.736 |
| 2.22999999999989 | 3.653 | 4.596 | 5.769 |
| 2.23499999999989 | 3.67 | 4.62 | 5.801 |
| 2.23999999999989 | 3.688 | 4.643 | 5.833 |
| 2.24499999999989 | 3.705 | 4.667 | 5.866 |
| 2.24999999999989 | 3.722 | 4.691 | 5.899 |
| 2.25499999999989 | 3.739 | 4.715 | 5.932 |
| 2.25999999999989 | 3.757 | 4.739 | 5.965 |
| 2.26499999999989 | 3.774 | 4.764 | 5.998 |
| 2.269999999999889 | 3.792 | 4.788 | 6.032 |
| 2.274999999999889 | 3.81 | 4.813 | 6.066 |
| 2.279999999999889 | 3.827 | 4.837 | 6.099 |
| 2.284999999999889 | 3.845 | 4.862 | 6.134 |
| 2.289999999999889 | 3.863 | 4.887 | 6.168 |
| 2.294999999999889 | 3.881 | 4.912 | 6.202 |
| 2.299999999999889 | 3.899 | 4.937 | 6.237 |
| 2.304999999999889 | 3.917 | 4.962 | 6.272 |
| 2.309999999999889 | 3.936 | 4.988 | 6.307 |
| 2.314999999999888 | 3.954 | 5.013 | 6.342 |
| 2.319999999999888 | 3.972 | 5.039 | 6.377 |
| 2.324999999999888 | 3.991 | 5.064 | 6.413 |
| 2.329999999999888 | 4.009 | 5.09 | 6.449 |
| 2.334999999999888 | 4.028 | 5.116 | 6.485 |
| 2.339999999999888 | 4.047 | 5.142 | 6.521 |
| 2.344999999999888 | 4.066 | 5.169 | 6.557 |
| 2.349999999999888 | 4.084 | 5.195 | 6.594 |
| 2.354999999999888 | 4.103 | 5.222 | 6.631 |
| 2.359999999999887 | 4.122 | 5.248 | 6.668 |
| 2.364999999999887 | 4.142 | 5.275 | 6.705 |
| 2.369999999999887 | 4.161 | 5.302 | 6.742 |
| 2.374999999999887 | 4.18 | 5.329 | 6.78 |
| 2.379999999999887 | 4.2 | 5.356 | 6.818 |
| 2.384999999999887 | 4.219 | 5.383 | 6.856 |
| 2.389999999999887 | 4.239 | 5.411 | 6.894 |
| 2.394999999999887 | 4.258 | 5.439 | 6.932 |
| 2.399999999999887 | 4.278 | 5.466 | 6.971 |
| 2.404999999999887 | 4.298 | 5.494 | 7.01 |
| 2.409999999999886 | 4.318 | 5.522 | 7.049 |
| 2.414999999999886 | 4.338 | 5.55 | 7.088 |
| 2.419999999999886 | 4.358 | 5.578 | 7.128 |
| 2.424999999999886 | 4.378 | 5.607 | 7.167 |
| 2.429999999999886 | 4.398 | 5.635 | 7.207 |
| 2.434999999999886 | 4.418 | 5.664 | 7.247 |
| 2.439999999999886 | 4.439 | 5.693 | 7.288 |
| 2.444999999999886 | 4.459 | 5.722 | 7.328 |
| 2.449999999999886 | 4.48 | 5.751 | 7.369 |
| 2.454999999999885 | 4.501 | 5.78 | 7.41 |
| 2.459999999999885 | 4.521 | 5.81 | 7.451 |
| 2.464999999999885 | 4.542 | 5.839 | 7.493 |
| 2.469999999999885 | 4.563 | 5.869 | 7.534 |
| 2.474999999999885 | 4.584 | 5.899 | 7.576 |
| 2.479999999999885 | 4.606 | 5.929 | 7.618 |
| 2.484999999999885 | 4.627 | 5.959 | 7.661 |
| 2.489999999999885 | 4.648 | 5.989 | 7.703 |
| 2.494999999999885 | 4.67 | 6.02 | 7.746 |
| 2.499999999999884 | 4.691 | 6.05 | 7.789 |
| 2.504999999999884 | 4.713 | 6.081 | 7.833 |
| 2.509999999999884 | 4.735 | 6.112 | 7.876 |
| 2.514999999999884 | 4.756 | 6.143 | 7.92 |
| 2.519999999999884 | 4.778 | 6.174 | 7.964 |
| 2.524999999999884 | 4.8 | 6.205 | 8.008 |
| 2.529999999999884 | 4.822 | 6.237 | 8.053 |
| 2.534999999999884 | 4.845 | 6.269 | 8.098 |
| 2.539999999999884 | 4.867 | 6.3 | 8.143 |
| 2.544999999999884 | 4.889 | 6.332 | 8.188 |
| 2.549999999999883 | 4.912 | 6.365 | 8.233 |
| 2.554999999999883 | 4.934 | 6.397 | 8.279 |
| 2.559999999999883 | 4.957 | 6.429 | 8.325 |
| 2.564999999999883 | 4.98 | 6.462 | 8.371 |
| 2.569999999999883 | 5.003 | 6.495 | 8.418 |
| 2.574999999999883 | 5.026 | 6.528 | 8.465 |
| 2.579999999999883 | 5.049 | 6.561 | 8.512 |
| 2.584999999999883 | 5.072 | 6.594 | 8.559 |
| 2.589999999999883 | 5.096 | 6.627 | 8.606 |
| 2.594999999999882 | 5.119 | 6.661 | 8.654 |
| 2.599999999999882 | 5.142 | 6.695 | 8.702 |
| 2.604999999999882 | 5.166 | 6.729 | 8.75 |
| 2.609999999999882 | 5.19 | 6.763 | 8.799 |
| 2.614999999999882 | 5.214 | 6.797 | 8.848 |
| 2.619999999999882 | 5.238 | 6.831 | 8.897 |
| 2.624999999999882 | 5.262 | 6.866 | 8.946 |
| 2.629999999999882 | 5.286 | 6.901 | 8.996 |
| 2.634999999999882 | 5.31 | 6.936 | 9.046 |
| 2.639999999999881 | 5.334 | 6.971 | 9.096 |
| 2.644999999999881 | 5.359 | 7.006 | 9.147 |
| 2.649999999999881 | 5.383 | 7.042 | 9.197 |
| 2.654999999999881 | 5.408 | 7.077 | 9.248 |
| 2.659999999999881 | 5.433 | 7.113 | 9.3 |
| 2.664999999999881 | 5.458 | 7.149 | 9.351 |
| 2.669999999999881 | 5.483 | 7.185 | 9.403 |
| 2.674999999999881 | 5.508 | 7.222 | 9.455 |
| 2.679999999999881 | 5.533 | 7.258 | 9.508 |
| 2.68499999999988 | 5.559 | 7.295 | 9.56 |
| 2.68999999999988 | 5.584 | 7.332 | 9.613 |
| 2.69499999999988 | 5.61 | 7.369 | 9.667 |
| 2.69999999999988 | 5.635 | 7.406 | 9.72 |
| 2.70499999999988 | 5.661 | 7.444 | 9.774 |
| 2.70999999999988 | 5.687 | 7.481 | 9.828 |
| 2.71499999999988 | 5.713 | 7.519 | 9.883 |
| 2.71999999999988 | 5.739 | 7.557 | 9.938 |
| 2.72499999999988 | 5.766 | 7.595 | 9.993 |
| 2.72999999999988 | 5.792 | 7.634 | 10.048 |
| 2.734999999999879 | 5.819 | 7.672 | 10.104 |
| 2.739999999999879 | 5.845 | 7.711 | 10.16 |
| 2.744999999999879 | 5.872 | 7.75 | 10.216 |
| 2.749999999999879 | 5.899 | 7.789 | 10.273 |
| 2.754999999999879 | 5.926 | 7.829 | 10.33 |
| 2.759999999999879 | 5.953 | 7.868 | 10.387 |
| 2.764999999999879 | 5.98 | 7.908 | 10.444 |
| 2.769999999999879 | 6.007 | 7.948 | 10.502 |
| 2.774999999999879 | 6.035 | 7.988 | 10.56 |
| 2.779999999999878 | 6.062 | 8.028 | 10.619 |
| 2.784999999999878 | 6.09 | 8.069 | 10.678 |
| 2.789999999999878 | 6.118 | 8.11 | 10.737 |
| 2.794999999999878 | 6.146 | 8.151 | 10.796 |
| 2.799999999999878 | 6.174 | 8.192 | 10.856 |
| 2.804999999999878 | 6.202 | 8.233 | 10.916 |
| 2.809999999999878 | 6.231 | 8.275 | 10.977 |
| 2.814999999999878 | 6.259 | 8.317 | 11.038 |
| 2.819999999999878 | 6.288 | 8.359 | 11.099 |
| 2.824999999999878 | 6.316 | 8.401 | 11.16 |
| 2.829999999999877 | 6.345 | 8.443 | 11.222 |
| 2.834999999999877 | 6.374 | 8.486 | 11.284 |
| 2.839999999999877 | 6.403 | 8.529 | 11.347 |
| 2.844999999999877 | 6.433 | 8.572 | 11.409 |
| 2.849999999999877 | 6.462 | 8.615 | 11.473 |
| 2.854999999999877 | 6.491 | 8.658 | 11.536 |
| 2.859999999999877 | 6.521 | 8.702 | 11.6 |
| 2.864999999999877 | 6.551 | 8.746 | 11.664 |
| 2.869999999999877 | 6.581 | 8.79 | 11.729 |
| 2.874999999999876 | 6.611 | 8.835 | 11.794 |
| 2.879999999999876 | 6.641 | 8.879 | 11.859 |
| 2.884999999999876 | 6.671 | 8.924 | 11.925 |
| 2.889999999999876 | 6.702 | 8.969 | 11.991 |
| 2.894999999999876 | 6.732 | 9.014 | 12.057 |
| 2.899999999999876 | 6.763 | 9.06 | 12.124 |
| 2.904999999999876 | 6.794 | 9.105 | 12.191 |
| 2.909999999999876 | 6.825 | 9.151 | 12.258 |
| 2.914999999999876 | 6.856 | 9.197 | 12.326 |
| 2.919999999999876 | 6.887 | 9.244 | 12.394 |
| 2.924999999999875 | 6.918 | 9.29 | 12.463 |
| 2.929999999999875 | 6.95 | 9.337 | 12.532 |
| 2.934999999999875 | 6.981 | 9.384 | 12.601 |
| 2.939999999999875 | 7.013 | 9.431 | 12.671 |
| 2.944999999999875 | 7.045 | 9.479 | 12.741 |
| 2.949999999999875 | 7.077 | 9.527 | 12.811 |
| 2.954999999999875 | 7.11 | 9.575 | 12.882 |
| 2.959999999999875 | 7.142 | 9.623 | 12.954 |
| 2.964999999999875 | 7.174 | 9.672 | 13.025 |
| 2.969999999999874 | 7.207 | 9.72 | 13.097 |
| 2.974999999999874 | 7.24 | 9.769 | 13.17 |
| 2.979999999999874 | 7.273 | 9.819 | 13.242 |
| 2.984999999999874 | 7.306 | 9.868 | 13.316 |
| 2.989999999999874 | 7.339 | 9.918 | 13.389 |
| 2.994999999999874 | 7.373 | 9.968 | 13.463 |
| 2.999999999999874 | 7.406 | 10.018 | 13.538 |
| 3.004999999999874 | 7.44 | 10.068 | 13.613 |
| 3.009999999999874 | 7.474 | 10.119 | 13.688 |
| 3.014999999999874 | 7.508 | 10.17 | 13.764 |
| 3.019999999999873 | 7.542 | 10.221 | 13.84 |
| 3.024999999999873 | 7.576 | 10.273 | 13.916 |
| 3.029999999999873 | 7.611 | 10.324 | 13.993 |
| 3.034999999999873 | 7.645 | 10.376 | 14.071 |
| 3.039999999999873 | 7.68 | 10.429 | 14.148 |
| 3.044999999999873 | 7.715 | 10.481 | 14.227 |
| 3.049999999999873 | 7.75 | 10.534 | 14.305 |
| 3.054999999999873 | 7.785 | 10.587 | 14.384 |
| 3.059999999999873 | 7.821 | 10.64 | 14.464 |
| 3.064999999999872 | 7.856 | 10.694 | 14.544 |
| 3.069999999999872 | 7.892 | 10.748 | 14.624 |
| 3.074999999999872 | 7.928 | 10.802 | 14.705 |
| 3.079999999999872 | 7.964 | 10.856 | 14.786 |
| 3.084999999999872 | 8 | 10.911 | 14.868 |
| 3.089999999999872 | 8.037 | 10.966 | 14.95 |
| 3.094999999999872 | 8.073 | 11.021 | 15.033 |
| 3.099999999999872 | 8.11 | 11.076 | 15.116 |
| 3.104999999999872 | 8.147 | 11.132 | 15.2 |
| 3.109999999999872 | 8.184 | 11.188 | 15.284 |
| 3.114999999999871 | 8.221 | 11.245 | 15.368 |
| 3.119999999999871 | 8.258 | 11.301 | 15.453 |
| 3.124999999999871 | 8.296 | 11.358 | 15.538 |
| 3.129999999999871 | 8.333 | 11.415 | 15.624 |
| 3.134999999999871 | 8.371 | 11.473 | 15.711 |
| 3.139999999999871 | 8.409 | 11.53 | 15.798 |
| 3.144999999999871 | 8.447 | 11.588 | 15.885 |
| 3.149999999999871 | 8.486 | 11.647 | 15.973 |
| 3.154999999999871 | 8.524 | 11.705 | 16.061 |
| 3.15999999999987 | 8.563 | 11.764 | 16.15 |
| 3.16499999999987 | 8.602 | 11.823 | 16.239 |
| 3.16999999999987 | 8.641 | 11.883 | 16.329 |
| 3.17499999999987 | 8.68 | 11.943 | 16.419 |
| 3.17999999999987 | 8.72 | 12.003 | 16.51 |
| 3.18499999999987 | 8.759 | 12.063 | 16.601 |
| 3.18999999999987 | 8.799 | 12.124 | 16.692 |
| 3.19499999999987 | 8.839 | 12.185 | 16.785 |
| 3.19999999999987 | 8.879 | 12.246 | 16.877 |
| 3.204999999999869 | 8.919 | 12.307 | 16.971 |
| 3.209999999999869 | 8.96 | 12.369 | 17.064 |
| 3.214999999999869 | 9.001 | 12.432 | 17.159 |
| 3.219999999999869 | 9.041 | 12.494 | 17.253 |
| 3.224999999999869 | 9.082 | 12.557 | 17.349 |
| 3.229999999999869 | 9.124 | 12.62 | 17.445 |
| 3.234999999999869 | 9.165 | 12.684 | 17.541 |
| 3.239999999999869 | 9.207 | 12.747 | 17.638 |
| 3.244999999999869 | 9.248 | 12.811 | 17.735 |
| 3.249999999999869 | 9.29 | 12.876 | 17.833 |
| 3.254999999999868 | 9.332 | 12.941 | 17.932 |
| 3.259999999999868 | 9.375 | 13.006 | 18.031 |
| 3.264999999999868 | 9.417 | 13.071 | 18.13 |
| 3.269999999999868 | 9.46 | 13.137 | 18.231 |
| 3.274999999999868 | 9.503 | 13.203 | 18.331 |
| 3.279999999999868 | 9.546 | 13.269 | 18.433 |
| 3.284999999999868 | 9.589 | 13.336 | 18.534 |
| 3.289999999999868 | 9.633 | 13.403 | 18.637 |
| 3.294999999999868 | 9.676 | 13.47 | 18.74 |
| 3.299999999999867 | 9.72 | 13.538 | 18.843 |
| 3.304999999999867 | 9.764 | 13.606 | 18.947 |
| 3.309999999999867 | 9.809 | 13.674 | 19.052 |
| 3.314999999999867 | 9.853 | 13.743 | 19.157 |
| 3.319999999999867 | 9.898 | 13.812 | 19.263 |
| 3.324999999999867 | 9.943 | 13.882 | 19.369 |
| 3.329999999999867 | 9.988 | 13.951 | 19.476 |
| 3.334999999999867 | 10.033 | 14.021 | 19.584 |
| 3.339999999999867 | 10.078 | 14.092 | 19.692 |
| 3.344999999999866 | 10.124 | 14.163 | 19.801 |
| 3.349999999999866 | 10.17 | 14.234 | 19.91 |
| 3.354999999999866 | 10.216 | 14.305 | 20.02 |
| 3.359999999999866 | 10.262 | 14.377 | 20.131 |
| 3.364999999999866 | 10.309 | 14.449 | 20.242 |
| 3.369999999999866 | 10.356 | 14.522 | 20.353 |
| 3.374999999999866 | 10.403 | 14.595 | 20.466 |
| 3.379999999999866 | 10.45 | 14.668 | 20.579 |
| 3.384999999999866 | 10.497 | 14.742 | 20.692 |
| 3.389999999999866 | 10.545 | 14.816 | 20.807 |
| 3.394999999999865 | 10.592 | 14.891 | 20.922 |
| 3.399999999999865 | 10.64 | 14.965 | 21.037 |
| 3.404999999999865 | 10.689 | 15.041 | 21.153 |
| 3.409999999999865 | 10.737 | 15.116 | 21.27 |
| 3.414999999999865 | 10.786 | 15.192 | 21.388 |
| 3.419999999999865 | 10.834 | 15.268 | 21.506 |
| 3.424999999999865 | 10.884 | 15.345 | 21.624 |
| 3.429999999999865 | 10.933 | 15.422 | 21.744 |
| 3.434999999999865 | 10.982 | 15.5 | 21.864 |
| 3.439999999999864 | 11.032 | 15.577 | 21.984 |
| 3.444999999999864 | 11.082 | 15.656 | 22.106 |
| 3.449999999999864 | 11.132 | 15.734 | 22.228 |
| 3.454999999999864 | 11.183 | 15.813 | 22.351 |
| 3.459999999999864 | 11.233 | 15.893 | 22.474 |
| 3.464999999999864 | 11.284 | 15.973 | 22.598 |
| 3.469999999999864 | 11.335 | 16.053 | 22.723 |
| 3.474999999999864 | 11.387 | 16.133 | 22.848 |
| 3.479999999999864 | 11.438 | 16.214 | 22.974 |
| 3.484999999999864 | 11.49 | 16.296 | 23.101 |
| 3.489999999999863 | 11.542 | 16.378 | 23.229 |
| 3.494999999999863 | 11.594 | 16.46 | 23.357 |
| 3.499999999999863 | 11.647 | 16.543 | 23.486 |
| 3.504999999999863 | 11.699 | 16.626 | 23.616 |
| 3.509999999999863 | 11.752 | 16.709 | 23.746 |
| 3.514999999999863 | 11.805 | 16.793 | 23.877 |
| 3.519999999999863 | 11.859 | 16.877 | 24.009 |
| 3.524999999999863 | 11.913 | 16.962 | 24.141 |
| 3.529999999999863 | 11.967 | 17.047 | 24.275 |
| 3.534999999999862 | 12.021 | 17.133 | 24.409 |
| 3.539999999999862 | 12.075 | 17.219 | 24.543 |
| 3.544999999999862 | 12.13 | 17.305 | 24.679 |
| 3.549999999999862 | 12.185 | 17.392 | 24.815 |
| 3.554999999999862 | 12.24 | 17.48 | 24.952 |
| 3.559999999999862 | 12.295 | 17.567 | 25.09 |
| 3.564999999999862 | 12.351 | 17.656 | 25.228 |
| 3.569999999999862 | 12.407 | 17.744 | 25.367 |
| 3.574999999999862 | 12.463 | 17.833 | 25.507 |
| 3.579999999999862 | 12.519 | 17.923 | 25.648 |
| 3.584999999999861 | 12.576 | 18.013 | 25.79 |
| 3.589999999999861 | 12.633 | 18.103 | 25.932 |
| 3.594999999999861 | 12.69 | 18.194 | 26.075 |
| 3.599999999999861 | 12.747 | 18.285 | 26.219 |
| 3.604999999999861 | 12.805 | 18.377 | 26.364 |
| 3.609999999999861 | 12.863 | 18.47 | 26.509 |
| 3.614999999999861 | 12.921 | 18.562 | 26.656 |
| 3.619999999999861 | 12.98 | 18.655 | 26.803 |
| 3.62499999999986 | 13.038 | 18.749 | 26.951 |
| 3.62999999999986 | 13.097 | 18.843 | 27.099 |
| 3.63499999999986 | 13.156 | 18.938 | 27.249 |
| 3.63999999999986 | 13.216 | 19.033 | 27.399 |
| 3.64499999999986 | 13.276 | 19.128 | 27.551 |
| 3.64999999999986 | 13.336 | 19.224 | 27.703 |
| 3.65499999999986 | 13.396 | 19.321 | 27.856 |
| 3.65999999999986 | 13.457 | 19.418 | 28.009 |
| 3.66499999999986 | 13.518 | 19.515 | 28.164 |
| 3.669999999999859 | 13.579 | 19.613 | 28.319 |
| 3.674999999999859 | 13.64 | 19.712 | 28.476 |
| 3.679999999999859 | 13.702 | 19.811 | 28.633 |
| 3.684999999999859 | 13.764 | 19.91 | 28.791 |
| 3.689999999999859 | 13.826 | 20.01 | 28.95 |
| 3.694999999999859 | 13.888 | 20.11 | 29.109 |
| 3.699999999999859 | 13.951 | 20.211 | 29.27 |
| 3.704999999999859 | 14.014 | 20.313 | 29.431 |
| 3.709999999999859 | 14.078 | 20.415 | 29.594 |
| 3.714999999999859 | 14.141 | 20.517 | 29.757 |
| 3.719999999999858 | 14.205 | 20.62 | 29.921 |
| 3.724999999999858 | 14.27 | 20.724 | 30.087 |
| 3.729999999999858 | 14.334 | 20.828 | 30.253 |
| 3.734999999999858 | 14.399 | 20.932 | 30.419 |
| 3.739999999999858 | 14.464 | 21.037 | 30.587 |
| 3.744999999999858 | 14.529 | 21.143 | 30.756 |
| 3.749999999999858 | 14.595 | 21.249 | 30.926 |
| 3.754999999999858 | 14.661 | 21.355 | 31.096 |
| 3.759999999999858 | 14.727 | 21.463 | 31.268 |
| 3.764999999999857 | 14.794 | 21.57 | 31.441 |
| 3.769999999999857 | 14.861 | 21.679 | 31.614 |
| 3.774999999999857 | 14.928 | 21.787 | 31.789 |
| 3.779999999999857 | 14.995 | 21.897 | 31.964 |
| 3.784999999999857 | 15.063 | 22.006 | 32.14 |
| 3.789999999999857 | 15.131 | 22.117 | 32.318 |
| 3.794999999999857 | 15.2 | 22.228 | 32.496 |
| 3.799999999999857 | 15.268 | 22.339 | 32.675 |
| 3.804999999999857 | 15.337 | 22.451 | 32.856 |
| 3.809999999999857 | 15.407 | 22.564 | 33.037 |
| 3.814999999999856 | 15.476 | 22.677 | 33.219 |
| 3.819999999999856 | 15.546 | 22.791 | 33.402 |
| 3.824999999999856 | 15.617 | 22.905 | 33.587 |
| 3.829999999999856 | 15.687 | 23.02 | 33.772 |
| 3.834999999999856 | 15.758 | 23.136 | 33.958 |
| 3.839999999999856 | 15.829 | 23.252 | 34.146 |
| 3.844999999999856 | 15.901 | 23.369 | 34.334 |
| 3.849999999999856 | 15.973 | 23.486 | 34.524 |
| 3.854999999999856 | 16.045 | 23.604 | 34.714 |
| 3.859999999999855 | 16.117 | 23.722 | 34.906 |
| 3.864999999999855 | 16.19 | 23.841 | 35.098 |
| 3.869999999999855 | 16.263 | 23.961 | 35.292 |
| 3.874999999999855 | 16.337 | 24.081 | 35.487 |
| 3.879999999999855 | 16.411 | 24.202 | 35.682 |
| 3.884999999999855 | 16.485 | 24.323 | 35.879 |
| 3.889999999999855 | 16.559 | 24.445 | 36.077 |
| 3.894999999999855 | 16.634 | 24.568 | 36.276 |
| 3.899999999999855 | 16.709 | 24.691 | 36.476 |
| 3.904999999999855 | 16.785 | 24.815 | 36.678 |
| 3.909999999999854 | 16.861 | 24.939 | 36.88 |
| 3.914999999999854 | 16.937 | 25.065 | 37.083 |
| 3.919999999999854 | 17.013 | 25.19 | 37.288 |
| 3.924999999999854 | 17.09 | 25.317 | 37.494 |
| 3.929999999999854 | 17.167 | 25.444 | 37.701 |
| 3.934999999999854 | 17.245 | 25.571 | 37.909 |
| 3.939999999999854 | 17.323 | 25.7 | 38.118 |
| 3.944999999999854 | 17.401 | 25.828 | 38.328 |
| 3.949999999999854 | 17.48 | 25.958 | 38.54 |
| 3.954999999999853 | 17.559 | 26.088 | 38.752 |
| 3.959999999999853 | 17.638 | 26.219 | 38.966 |
| 3.964999999999853 | 17.718 | 26.351 | 39.181 |
| 3.969999999999853 | 17.798 | 26.483 | 39.397 |
| 3.974999999999853 | 17.878 | 26.616 | 39.614 |
| 3.979999999999853 | 17.959 | 26.749 | 39.833 |
| 3.984999999999853 | 18.04 | 26.883 | 40.053 |
| 3.989999999999853 | 18.121 | 27.018 | 40.274 |
| 3.994999999999853 | 18.203 | 27.154 | 40.496 |
| 3.999999999999853 | 18.285 | 27.29 | 40.719 |
| 4.004999999999852 | 18.368 | 27.427 | 40.944 |
| 4.009999999999852 | 18.451 | 27.564 | 41.17 |
| 4.014999999999852 | 18.534 | 27.703 | 41.397 |
| 4.019999999999852 | 18.618 | 27.842 | 41.625 |
| 4.024999999999852 | 18.702 | 27.981 | 41.855 |
| 4.029999999999852 | 18.787 | 28.122 | 42.086 |
| 4.034999999999852 | 18.871 | 28.263 | 42.318 |
| 4.039999999999851 | 18.957 | 28.404 | 42.551 |
| 4.044999999999852 | 19.042 | 28.547 | 42.786 |
| 4.049999999999851 | 19.128 | 28.69 | 43.022 |
| 4.054999999999851 | 19.215 | 28.834 | 43.26 |
| 4.059999999999851 | 19.301 | 28.979 | 43.498 |
| 4.064999999999851 | 19.389 | 29.124 | 43.738 |
| 4.069999999999851 | 19.476 | 29.27 | 43.979 |
| 4.074999999999851 | 19.564 | 29.417 | 44.222 |
| 4.07999999999985 | 19.653 | 29.564 | 44.466 |
| 4.084999999999851 | 19.741 | 29.713 | 44.711 |
| 4.08999999999985 | 19.83 | 29.862 | 44.958 |
| 4.094999999999851 | 19.92 | 30.011 | 45.206 |
| 4.09999999999985 | 20.01 | 30.162 | 45.455 |
| 4.10499999999985 | 20.1 | 30.313 | 45.706 |
| 4.10999999999985 | 20.191 | 30.465 | 45.958 |
| 4.11499999999985 | 20.282 | 30.618 | 46.212 |
| 4.11999999999985 | 20.374 | 30.771 | 46.467 |
| 4.12499999999985 | 20.466 | 30.926 | 46.723 |
| 4.12999999999985 | 20.558 | 31.081 | 46.981 |
| 4.13499999999985 | 20.651 | 31.237 | 47.24 |
| 4.13999999999985 | 20.744 | 31.393 | 47.501 |
| 4.144999999999849 | 20.838 | 31.551 | 47.763 |
| 4.14999999999985 | 20.932 | 31.709 | 48.026 |
| 4.154999999999849 | 21.027 | 31.868 | 48.291 |
| 4.15999999999985 | 21.122 | 32.028 | 48.557 |
| 4.164999999999849 | 21.217 | 32.189 | 48.825 |
| 4.169999999999849 | 21.313 | 32.35 | 49.095 |
| 4.174999999999849 | 21.409 | 32.512 | 49.365 |
| 4.179999999999848 | 21.506 | 32.675 | 49.638 |
| 4.184999999999849 | 21.603 | 32.839 | 49.912 |
| 4.189999999999848 | 21.7 | 33.004 | 50.187 |
| 4.194999999999848 | 21.798 | 33.169 | 50.464 |
| 4.199999999999848 | 21.897 | 33.336 | 50.742 |
| 4.204999999999848 | 21.995 | 33.503 | 51.022 |
| 4.209999999999848 | 22.095 | 33.671 | 51.303 |
| 4.214999999999848 | 22.195 | 33.84 | 51.586 |
| 4.219999999999847 | 22.295 | 34.009 | 51.871 |
| 4.224999999999848 | 22.395 | 34.18 | 52.157 |
| 4.229999999999847 | 22.496 | 34.351 | 52.445 |
| 4.234999999999847 | 22.598 | 34.524 | 52.734 |
| 4.239999999999847 | 22.7 | 34.697 | 53.025 |
| 4.244999999999847 | 22.803 | 34.871 | 53.318 |
| 4.249999999999847 | 22.905 | 35.046 | 53.612 |
| 4.254999999999847 | 23.009 | 35.221 | 53.907 |
| 4.259999999999846 | 23.113 | 35.398 | 54.205 |
| 4.264999999999847 | 23.217 | 35.575 | 54.504 |
| 4.269999999999846 | 23.322 | 35.754 | 54.804 |
| 4.274999999999846 | 23.427 | 35.933 | 55.107 |
| 4.279999999999846 | 23.533 | 36.113 | 55.411 |
| 4.284999999999846 | 23.639 | 36.294 | 55.716 |
| 4.289999999999846 | 23.746 | 36.476 | 56.024 |
| 4.294999999999846 | 23.853 | 36.659 | 56.333 |
| 4.299999999999846 | 23.961 | 36.843 | 56.643 |
| 4.304999999999846 | 24.069 | 37.028 | 56.956 |
| 4.309999999999845 | 24.178 | 37.214 | 57.27 |
| 4.314999999999846 | 24.287 | 37.4 | 57.586 |
| 4.319999999999845 | 24.396 | 37.588 | 57.904 |
| 4.324999999999846 | 24.506 | 37.776 | 58.223 |
| 4.329999999999845 | 24.617 | 37.966 | 58.544 |
| 4.334999999999845 | 24.728 | 38.156 | 58.867 |
| 4.339999999999845 | 24.84 | 38.347 | 59.192 |
| 4.344999999999845 | 24.952 | 38.54 | 59.518 |
| 4.349999999999845 | 25.065 | 38.733 | 59.847 |
| 4.354999999999845 | 25.178 | 38.927 | 60.177 |
| 4.359999999999844 | 25.291 | 39.122 | 60.509 |
| 4.364999999999845 | 25.406 | 39.318 | 60.842 |
| 4.369999999999844 | 25.52 | 39.515 | 61.178 |
| 4.374999999999844 | 25.635 | 39.714 | 61.515 |
| 4.379999999999844 | 25.751 | 39.913 | 61.855 |
| 4.384999999999844 | 25.867 | 40.113 | 62.196 |
| 4.389999999999844 | 25.984 | 40.314 | 62.539 |
| 4.394999999999844 | 26.101 | 40.516 | 62.884 |
| 4.399999999999844 | 26.219 | 40.719 | 63.231 |
| 4.404999999999844 | 26.337 | 40.923 | 63.579 |
| 4.409999999999843 | 26.456 | 41.129 | 63.93 |
| 4.414999999999844 | 26.576 | 41.335 | 64.283 |
| 4.419999999999843 | 26.696 | 41.542 | 64.637 |
| 4.424999999999843 | 26.816 | 41.75 | 64.994 |
| 4.429999999999843 | 26.937 | 41.96 | 65.352 |
| 4.434999999999843 | 27.059 | 42.17 | 65.713 |
| 4.439999999999843 | 27.181 | 42.382 | 66.075 |
| 4.444999999999843 | 27.304 | 42.594 | 66.44 |
| 4.449999999999842 | 27.427 | 42.808 | 66.806 |
| 4.454999999999843 | 27.551 | 43.022 | 67.175 |
| 4.459999999999842 | 27.675 | 43.238 | 67.545 |
| 4.464999999999843 | 27.8 | 43.455 | 67.918 |
| 4.469999999999842 | 27.925 | 43.673 | 68.292 |
| 4.474999999999842 | 28.051 | 43.892 | 68.669 |
| 4.479999999999842 | 28.178 | 44.112 | 69.048 |
| 4.484999999999842 | 28.305 | 44.333 | 69.429 |
| 4.489999999999842 | 28.433 | 44.555 | 69.812 |
| 4.494999999999842 | 28.561 | 44.779 | 70.197 |
| 4.499999999999841 | 28.69 | 45.003 | 70.584 |
| 4.504999999999842 | 28.819 | 45.229 | 70.973 |
| 4.509999999999841 | 28.95 | 45.455 | 71.365 |
| 4.514999999999842 | 29.08 | 45.683 | 71.758 |
| 4.519999999999841 | 29.211 | 45.912 | 72.154 |
| 4.524999999999841 | 29.343 | 46.143 | 72.552 |
| 4.529999999999841 | 29.476 | 46.374 | 72.952 |
| 4.534999999999841 | 29.609 | 46.606 | 73.355 |
| 4.53999999999984 | 29.742 | 46.84 | 73.759 |
| 4.544999999999841 | 29.877 | 47.075 | 74.166 |
| 4.54999999999984 | 30.011 | 47.311 | 74.575 |
| 4.554999999999841 | 30.147 | 47.548 | 74.987 |
| 4.55999999999984 | 30.283 | 47.787 | 75.4 |
| 4.564999999999841 | 30.419 | 48.026 | 75.816 |
| 4.56999999999984 | 30.557 | 48.267 | 76.234 |
| 4.57499999999984 | 30.695 | 48.509 | 76.655 |
| 4.57999999999984 | 30.833 | 48.752 | 77.077 |
| 4.58499999999984 | 30.972 | 48.996 | 77.503 |
| 4.58999999999984 | 31.112 | 49.242 | 77.93 |
| 4.59499999999984 | 31.252 | 49.489 | 78.36 |
| 4.59999999999984 | 31.393 | 49.737 | 78.792 |
| 4.60499999999984 | 31.535 | 49.986 | 79.227 |
| 4.60999999999984 | 31.677 | 50.237 | 79.664 |
| 4.614999999999839 | 31.82 | 50.489 | 80.103 |
| 4.61999999999984 | 31.964 | 50.742 | 80.545 |
| 4.624999999999839 | 32.108 | 50.996 | 80.989 |
| 4.62999999999984 | 32.253 | 51.252 | 81.436 |
| 4.634999999999839 | 32.399 | 51.509 | 81.885 |
| 4.639999999999838 | 32.545 | 51.767 | 82.337 |
| 4.644999999999839 | 32.692 | 52.027 | 82.791 |
| 4.649999999999838 | 32.839 | 52.288 | 83.247 |
| 4.654999999999839 | 32.987 | 52.55 | 83.707 |
| 4.659999999999838 | 33.136 | 52.813 | 84.168 |
| 4.664999999999838 | 33.286 | 53.078 | 84.632 |
| 4.669999999999838 | 33.436 | 53.344 | 85.099 |
| 4.674999999999838 | 33.587 | 53.612 | 85.569 |
| 4.679999999999837 | 33.738 | 53.88 | 86.041 |
| 4.684999999999838 | 33.891 | 54.151 | 86.515 |
| 4.689999999999837 | 34.043 | 54.422 | 86.992 |
| 4.694999999999838 | 34.197 | 54.695 | 87.472 |
| 4.699999999999837 | 34.351 | 54.969 | 87.955 |
| 4.704999999999837 | 34.506 | 55.245 | 88.44 |
| 4.709999999999837 | 34.662 | 55.522 | 88.927 |
| 4.714999999999837 | 34.818 | 55.8 | 89.418 |
| 4.719999999999837 | 34.976 | 56.08 | 89.911 |
| 4.724999999999837 | 35.133 | 56.361 | 90.407 |
| 4.729999999999836 | 35.292 | 56.643 | 90.906 |
| 4.734999999999836 | 35.451 | 56.927 | 91.407 |
| 4.739999999999836 | 35.611 | 57.213 | 91.911 |
| 4.744999999999836 | 35.772 | 57.5 | 92.418 |
| 4.749999999999836 | 35.933 | 57.788 | 92.928 |
| 4.754999999999836 | 36.095 | 58.078 | 93.44 |
| 4.759999999999836 | 36.258 | 58.369 | 93.956 |
| 4.764999999999836 | 36.422 | 58.661 | 94.474 |
| 4.769999999999836 | 36.586 | 58.955 | 94.995 |
| 4.774999999999835 | 36.751 | 59.251 | 95.519 |
| 4.779999999999835 | 36.917 | 59.548 | 96.046 |
| 4.784999999999835 | 37.083 | 59.847 | 96.576 |
| 4.789999999999835 | 37.251 | 60.147 | 97.108 |
| 4.794999999999835 | 37.419 | 60.448 | 97.644 |
| 4.799999999999835 | 37.588 | 60.751 | 98.182 |
| 4.804999999999835 | 37.757 | 61.056 | 98.724 |
| 4.809999999999835 | 37.928 | 61.362 | 99.268 |
| 4.814999999999835 | 38.099 | 61.669 | 99.816 |
| 4.819999999999835 | 38.271 | 61.979 | 100.366 |
| 4.824999999999835 | 38.443 | 62.289 | 100.92 |
| 4.829999999999834 | 38.617 | 62.601 | 101.477 |
| 4.834999999999834 | 38.791 | 62.915 | 102.036 |
| 4.839999999999834 | 38.966 | 63.231 | 102.599 |
| 4.844999999999834 | 39.142 | 63.548 | 103.165 |
| 4.849999999999834 | 39.318 | 63.866 | 103.734 |
| 4.854999999999834 | 39.496 | 64.186 | 104.306 |
| 4.859999999999834 | 39.674 | 64.508 | 104.881 |
| 4.864999999999834 | 39.853 | 64.832 | 105.46 |
| 4.869999999999834 | 40.033 | 65.157 | 106.042 |
| 4.874999999999834 | 40.213 | 65.483 | 106.626 |
| 4.879999999999833 | 40.395 | 65.812 | 107.214 |
| 4.884999999999834 | 40.577 | 66.141 | 107.806 |
| 4.889999999999833 | 40.76 | 66.473 | 108.4 |
| 4.894999999999833 | 40.944 | 66.806 | 108.998 |
| 4.899999999999833 | 41.129 | 67.141 | 109.599 |
| 4.904999999999833 | 41.314 | 67.478 | 110.204 |
| 4.909999999999833 | 41.501 | 67.816 | 110.812 |
| 4.914999999999833 | 41.688 | 68.156 | 111.423 |
| 4.919999999999832 | 41.876 | 68.498 | 112.037 |
| 4.924999999999833 | 42.065 | 68.841 | 112.655 |
| 4.929999999999832 | 42.255 | 69.186 | 113.277 |
| 4.934999999999832 | 42.445 | 69.533 | 113.901 |
| 4.939999999999832 | 42.637 | 69.882 | 114.53 |
| 4.944999999999832 | 42.829 | 70.232 | 115.161 |
| 4.949999999999832 | 43.022 | 70.584 | 115.796 |
| 4.954999999999832 | 43.216 | 70.938 | 116.435 |
| 4.959999999999832 | 43.411 | 71.293 | 117.077 |
| 4.964999999999832 | 43.607 | 71.651 | 117.723 |
| 4.969999999999831 | 43.804 | 72.01 | 118.372 |
| 4.974999999999831 | 44.001 | 72.371 | 119.025 |
| 4.97999999999983 | 44.2 | 72.734 | 119.682 |
| 4.984999999999831 | 44.399 | 73.098 | 120.342 |
| 4.98999999999983 | 44.6 | 73.465 | 121.005 |
| 4.994999999999831 | 44.801 | 73.833 | 121.673 |
| 4.99999999999983 | 45.003 | 74.203 | 122.344 |